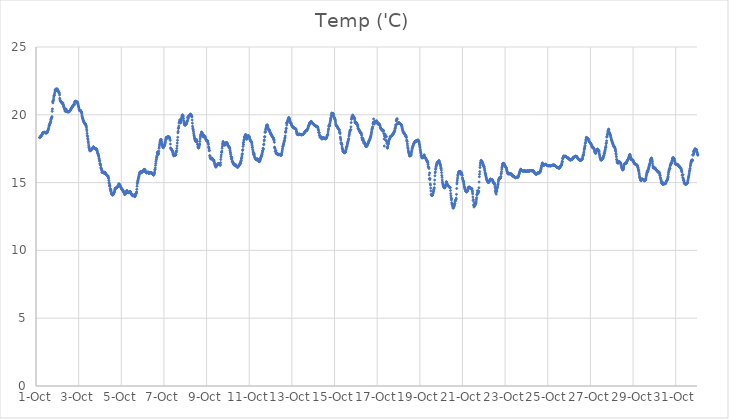
| Category | Temp ('C) |
|---|---|
| 44835.166666666664 | 18.316 |
| 44835.177083333336 | 18.323 |
| 44835.1875 | 18.346 |
| 44835.197916666664 | 18.352 |
| 44835.208333333336 | 18.401 |
| 44835.21875 | 18.418 |
| 44835.229166666664 | 18.423 |
| 44835.239583333336 | 18.449 |
| 44835.25 | 18.444 |
| 44835.260416666664 | 18.484 |
| 44835.270833333336 | 18.513 |
| 44835.28125 | 18.518 |
| 44835.291666666664 | 18.571 |
| 44835.302083333336 | 18.615 |
| 44835.3125 | 18.644 |
| 44835.322916666664 | 18.661 |
| 44835.333333333336 | 18.691 |
| 44835.34375 | 18.705 |
| 44835.354166666664 | 18.66 |
| 44835.364583333336 | 18.673 |
| 44835.375 | 18.666 |
| 44835.385416666664 | 18.716 |
| 44835.395833333336 | 18.705 |
| 44835.40625 | 18.696 |
| 44835.416666666664 | 18.709 |
| 44835.427083333336 | 18.708 |
| 44835.4375 | 18.697 |
| 44835.447916666664 | 18.677 |
| 44835.458333333336 | 18.656 |
| 44835.46875 | 18.69 |
| 44835.479166666664 | 18.652 |
| 44835.489583333336 | 18.699 |
| 44835.5 | 18.677 |
| 44835.510416666664 | 18.669 |
| 44835.520833333336 | 18.687 |
| 44835.53125 | 18.707 |
| 44835.541666666664 | 18.762 |
| 44835.552083333336 | 18.815 |
| 44835.5625 | 18.862 |
| 44835.572916666664 | 18.905 |
| 44835.583333333336 | 18.945 |
| 44835.59375 | 19.011 |
| 44835.604166666664 | 19.09 |
| 44835.614583333336 | 19.183 |
| 44835.625 | 19.224 |
| 44835.635416666664 | 19.267 |
| 44835.645833333336 | 19.33 |
| 44835.65625 | 19.365 |
| 44835.666666666664 | 19.397 |
| 44835.677083333336 | 19.439 |
| 44835.6875 | 19.517 |
| 44835.697916666664 | 19.621 |
| 44835.708333333336 | 19.674 |
| 44835.71875 | 19.729 |
| 44835.729166666664 | 19.785 |
| 44835.739583333336 | 19.809 |
| 44835.75 | 19.866 |
| 44835.760416666664 | 20.257 |
| 44835.770833333336 | 20.434 |
| 44835.78125 | 20.975 |
| 44835.791666666664 | 20.875 |
| 44835.802083333336 | 21.007 |
| 44835.8125 | 21.067 |
| 44835.822916666664 | 21.156 |
| 44835.833333333336 | 21.311 |
| 44835.84375 | 21.408 |
| 44835.854166666664 | 21.454 |
| 44835.864583333336 | 21.44 |
| 44835.875 | 21.59 |
| 44835.885416666664 | 21.683 |
| 44835.895833333336 | 21.836 |
| 44835.90625 | 21.815 |
| 44835.916666666664 | 21.844 |
| 44835.927083333336 | 21.895 |
| 44835.9375 | 21.79 |
| 44835.947916666664 | 21.871 |
| 44835.958333333336 | 21.793 |
| 44835.96875 | 21.844 |
| 44835.979166666664 | 21.918 |
| 44835.989583333336 | 21.901 |
| 44836.0 | 21.878 |
| 44836.010416666664 | 21.838 |
| 44836.020833333336 | 21.82 |
| 44836.03125 | 21.748 |
| 44836.041666666664 | 21.747 |
| 44836.052083333336 | 21.732 |
| 44836.0625 | 21.706 |
| 44836.072916666664 | 21.647 |
| 44836.083333333336 | 21.604 |
| 44836.09375 | 21.597 |
| 44836.104166666664 | 21.464 |
| 44836.114583333336 | 21.218 |
| 44836.125 | 21.097 |
| 44836.135416666664 | 21.034 |
| 44836.145833333336 | 21.001 |
| 44836.15625 | 20.998 |
| 44836.166666666664 | 20.982 |
| 44836.177083333336 | 20.953 |
| 44836.1875 | 20.934 |
| 44836.197916666664 | 20.919 |
| 44836.208333333336 | 20.902 |
| 44836.21875 | 20.879 |
| 44836.229166666664 | 20.845 |
| 44836.239583333336 | 20.822 |
| 44836.25 | 20.857 |
| 44836.260416666664 | 20.878 |
| 44836.270833333336 | 20.789 |
| 44836.28125 | 20.731 |
| 44836.291666666664 | 20.667 |
| 44836.302083333336 | 20.594 |
| 44836.3125 | 20.558 |
| 44836.322916666664 | 20.5 |
| 44836.333333333336 | 20.439 |
| 44836.34375 | 20.418 |
| 44836.354166666664 | 20.365 |
| 44836.364583333336 | 20.287 |
| 44836.375 | 20.253 |
| 44836.385416666664 | 20.417 |
| 44836.395833333336 | 20.286 |
| 44836.40625 | 20.286 |
| 44836.416666666664 | 20.412 |
| 44836.427083333336 | 20.293 |
| 44836.4375 | 20.297 |
| 44836.447916666664 | 20.251 |
| 44836.458333333336 | 20.224 |
| 44836.46875 | 20.217 |
| 44836.479166666664 | 20.225 |
| 44836.489583333336 | 20.235 |
| 44836.5 | 20.235 |
| 44836.510416666664 | 20.247 |
| 44836.520833333336 | 20.231 |
| 44836.53125 | 20.218 |
| 44836.541666666664 | 20.22 |
| 44836.552083333336 | 20.234 |
| 44836.5625 | 20.243 |
| 44836.572916666664 | 20.265 |
| 44836.583333333336 | 20.278 |
| 44836.59375 | 20.296 |
| 44836.604166666664 | 20.321 |
| 44836.614583333336 | 20.347 |
| 44836.625 | 20.37 |
| 44836.635416666664 | 20.41 |
| 44836.645833333336 | 20.449 |
| 44836.65625 | 20.477 |
| 44836.666666666664 | 20.504 |
| 44836.677083333336 | 20.537 |
| 44836.6875 | 20.552 |
| 44836.697916666664 | 20.57 |
| 44836.708333333336 | 20.596 |
| 44836.71875 | 20.627 |
| 44836.729166666664 | 20.658 |
| 44836.739583333336 | 20.687 |
| 44836.75 | 20.712 |
| 44836.760416666664 | 20.745 |
| 44836.770833333336 | 20.752 |
| 44836.78125 | 20.785 |
| 44836.791666666664 | 20.788 |
| 44836.802083333336 | 20.735 |
| 44836.8125 | 20.901 |
| 44836.822916666664 | 20.973 |
| 44836.833333333336 | 20.963 |
| 44836.84375 | 20.987 |
| 44836.854166666664 | 21.003 |
| 44836.864583333336 | 20.987 |
| 44836.875 | 20.973 |
| 44836.885416666664 | 20.976 |
| 44836.895833333336 | 20.936 |
| 44836.90625 | 20.969 |
| 44836.916666666664 | 20.955 |
| 44836.927083333336 | 20.95 |
| 44836.9375 | 20.918 |
| 44836.947916666664 | 20.909 |
| 44836.958333333336 | 20.83 |
| 44836.96875 | 20.79 |
| 44836.979166666664 | 20.718 |
| 44836.989583333336 | 20.641 |
| 44837.0 | 20.579 |
| 44837.010416666664 | 20.508 |
| 44837.020833333336 | 20.421 |
| 44837.03125 | 20.368 |
| 44837.041666666664 | 20.305 |
| 44837.052083333336 | 20.35 |
| 44837.0625 | 20.337 |
| 44837.072916666664 | 20.308 |
| 44837.083333333336 | 20.319 |
| 44837.09375 | 20.318 |
| 44837.104166666664 | 20.275 |
| 44837.114583333336 | 20.239 |
| 44837.125 | 20.203 |
| 44837.135416666664 | 20.198 |
| 44837.145833333336 | 20.093 |
| 44837.15625 | 19.977 |
| 44837.166666666664 | 19.878 |
| 44837.177083333336 | 19.787 |
| 44837.1875 | 19.73 |
| 44837.197916666664 | 19.69 |
| 44837.208333333336 | 19.625 |
| 44837.21875 | 19.584 |
| 44837.229166666664 | 19.544 |
| 44837.239583333336 | 19.489 |
| 44837.25 | 19.461 |
| 44837.260416666664 | 19.424 |
| 44837.270833333336 | 19.404 |
| 44837.28125 | 19.376 |
| 44837.291666666664 | 19.334 |
| 44837.302083333336 | 19.31 |
| 44837.3125 | 19.336 |
| 44837.322916666664 | 19.32 |
| 44837.333333333336 | 19.261 |
| 44837.34375 | 19.2 |
| 44837.354166666664 | 19.164 |
| 44837.364583333336 | 19.081 |
| 44837.375 | 18.938 |
| 44837.385416666664 | 18.811 |
| 44837.395833333336 | 18.632 |
| 44837.40625 | 18.473 |
| 44837.416666666664 | 18.404 |
| 44837.427083333336 | 18.257 |
| 44837.4375 | 18.154 |
| 44837.447916666664 | 18.03 |
| 44837.458333333336 | 17.92 |
| 44837.46875 | 17.77 |
| 44837.479166666664 | 17.597 |
| 44837.489583333336 | 17.636 |
| 44837.5 | 17.492 |
| 44837.510416666664 | 17.457 |
| 44837.520833333336 | 17.362 |
| 44837.53125 | 17.333 |
| 44837.541666666664 | 17.406 |
| 44837.552083333336 | 17.354 |
| 44837.5625 | 17.403 |
| 44837.572916666664 | 17.429 |
| 44837.583333333336 | 17.412 |
| 44837.59375 | 17.422 |
| 44837.604166666664 | 17.431 |
| 44837.614583333336 | 17.504 |
| 44837.625 | 17.467 |
| 44837.635416666664 | 17.504 |
| 44837.645833333336 | 17.507 |
| 44837.65625 | 17.532 |
| 44837.666666666664 | 17.578 |
| 44837.677083333336 | 17.612 |
| 44837.6875 | 17.627 |
| 44837.697916666664 | 17.647 |
| 44837.708333333336 | 17.607 |
| 44837.71875 | 17.588 |
| 44837.729166666664 | 17.587 |
| 44837.739583333336 | 17.544 |
| 44837.75 | 17.526 |
| 44837.760416666664 | 17.511 |
| 44837.770833333336 | 17.497 |
| 44837.78125 | 17.501 |
| 44837.791666666664 | 17.499 |
| 44837.802083333336 | 17.497 |
| 44837.8125 | 17.489 |
| 44837.822916666664 | 17.431 |
| 44837.833333333336 | 17.495 |
| 44837.84375 | 17.453 |
| 44837.854166666664 | 17.412 |
| 44837.864583333336 | 17.365 |
| 44837.875 | 17.294 |
| 44837.885416666664 | 17.223 |
| 44837.895833333336 | 17.166 |
| 44837.90625 | 17.136 |
| 44837.916666666664 | 17.05 |
| 44837.927083333336 | 17.036 |
| 44837.9375 | 16.967 |
| 44837.947916666664 | 16.893 |
| 44837.958333333336 | 16.778 |
| 44837.96875 | 16.725 |
| 44837.979166666664 | 16.585 |
| 44837.989583333336 | 16.599 |
| 44838.0 | 16.378 |
| 44838.010416666664 | 16.402 |
| 44838.020833333336 | 16.311 |
| 44838.03125 | 16.282 |
| 44838.041666666664 | 16.126 |
| 44838.052083333336 | 16.062 |
| 44838.0625 | 16.038 |
| 44838.072916666664 | 15.975 |
| 44838.083333333336 | 15.882 |
| 44838.09375 | 15.763 |
| 44838.104166666664 | 15.765 |
| 44838.114583333336 | 15.746 |
| 44838.125 | 15.767 |
| 44838.135416666664 | 15.757 |
| 44838.145833333336 | 15.741 |
| 44838.15625 | 15.748 |
| 44838.166666666664 | 15.751 |
| 44838.177083333336 | 15.791 |
| 44838.1875 | 15.739 |
| 44838.197916666664 | 15.698 |
| 44838.208333333336 | 15.667 |
| 44838.21875 | 15.758 |
| 44838.229166666664 | 15.759 |
| 44838.239583333336 | 15.751 |
| 44838.25 | 15.727 |
| 44838.260416666664 | 15.681 |
| 44838.270833333336 | 15.63 |
| 44838.28125 | 15.613 |
| 44838.291666666664 | 15.604 |
| 44838.302083333336 | 15.588 |
| 44838.3125 | 15.571 |
| 44838.322916666664 | 15.547 |
| 44838.333333333336 | 15.529 |
| 44838.34375 | 15.503 |
| 44838.354166666664 | 15.476 |
| 44838.364583333336 | 15.505 |
| 44838.375 | 15.483 |
| 44838.385416666664 | 15.432 |
| 44838.395833333336 | 15.353 |
| 44838.40625 | 15.296 |
| 44838.416666666664 | 15.159 |
| 44838.427083333336 | 15.011 |
| 44838.4375 | 14.935 |
| 44838.447916666664 | 14.755 |
| 44838.458333333336 | 14.817 |
| 44838.46875 | 14.742 |
| 44838.479166666664 | 14.559 |
| 44838.489583333336 | 14.518 |
| 44838.5 | 14.404 |
| 44838.510416666664 | 14.369 |
| 44838.520833333336 | 14.448 |
| 44838.53125 | 14.282 |
| 44838.541666666664 | 14.193 |
| 44838.552083333336 | 14.113 |
| 44838.5625 | 14.15 |
| 44838.572916666664 | 14.22 |
| 44838.583333333336 | 14.086 |
| 44838.59375 | 14.081 |
| 44838.604166666664 | 14.115 |
| 44838.614583333336 | 14.142 |
| 44838.625 | 14.112 |
| 44838.635416666664 | 14.17 |
| 44838.645833333336 | 14.186 |
| 44838.65625 | 14.241 |
| 44838.666666666664 | 14.293 |
| 44838.677083333336 | 14.323 |
| 44838.6875 | 14.393 |
| 44838.697916666664 | 14.47 |
| 44838.708333333336 | 14.532 |
| 44838.71875 | 14.569 |
| 44838.729166666664 | 14.573 |
| 44838.739583333336 | 14.572 |
| 44838.75 | 14.584 |
| 44838.760416666664 | 14.609 |
| 44838.770833333336 | 14.626 |
| 44838.78125 | 14.641 |
| 44838.791666666664 | 14.652 |
| 44838.802083333336 | 14.65 |
| 44838.8125 | 14.655 |
| 44838.822916666664 | 14.688 |
| 44838.833333333336 | 14.715 |
| 44838.84375 | 14.745 |
| 44838.854166666664 | 14.785 |
| 44838.864583333336 | 14.812 |
| 44838.875 | 14.847 |
| 44838.885416666664 | 14.92 |
| 44838.895833333336 | 14.887 |
| 44838.90625 | 14.813 |
| 44838.916666666664 | 14.787 |
| 44838.927083333336 | 14.852 |
| 44838.9375 | 14.771 |
| 44838.947916666664 | 14.742 |
| 44838.958333333336 | 14.71 |
| 44838.96875 | 14.7 |
| 44838.979166666664 | 14.669 |
| 44838.989583333336 | 14.62 |
| 44839.0 | 14.591 |
| 44839.010416666664 | 14.542 |
| 44839.020833333336 | 14.519 |
| 44839.03125 | 14.482 |
| 44839.041666666664 | 14.471 |
| 44839.052083333336 | 14.491 |
| 44839.0625 | 14.476 |
| 44839.072916666664 | 14.407 |
| 44839.083333333336 | 14.385 |
| 44839.09375 | 14.367 |
| 44839.104166666664 | 14.315 |
| 44839.114583333336 | 14.289 |
| 44839.125 | 14.331 |
| 44839.135416666664 | 14.237 |
| 44839.145833333336 | 14.185 |
| 44839.15625 | 14.117 |
| 44839.166666666664 | 14.124 |
| 44839.177083333336 | 14.175 |
| 44839.1875 | 14.201 |
| 44839.197916666664 | 14.208 |
| 44839.208333333336 | 14.228 |
| 44839.21875 | 14.224 |
| 44839.229166666664 | 14.234 |
| 44839.239583333336 | 14.278 |
| 44839.25 | 14.395 |
| 44839.260416666664 | 14.421 |
| 44839.270833333336 | 14.4 |
| 44839.28125 | 14.352 |
| 44839.291666666664 | 14.306 |
| 44839.302083333336 | 14.283 |
| 44839.3125 | 14.265 |
| 44839.322916666664 | 14.259 |
| 44839.333333333336 | 14.257 |
| 44839.34375 | 14.266 |
| 44839.354166666664 | 14.276 |
| 44839.364583333336 | 14.279 |
| 44839.375 | 14.286 |
| 44839.385416666664 | 14.283 |
| 44839.395833333336 | 14.291 |
| 44839.40625 | 14.359 |
| 44839.416666666664 | 14.336 |
| 44839.427083333336 | 14.314 |
| 44839.4375 | 14.269 |
| 44839.447916666664 | 14.193 |
| 44839.458333333336 | 14.165 |
| 44839.46875 | 14.161 |
| 44839.479166666664 | 14.16 |
| 44839.489583333336 | 14.14 |
| 44839.5 | 14.125 |
| 44839.510416666664 | 14.074 |
| 44839.520833333336 | 14.067 |
| 44839.53125 | 14.028 |
| 44839.541666666664 | 14.04 |
| 44839.552083333336 | 14.055 |
| 44839.5625 | 14.053 |
| 44839.572916666664 | 14.046 |
| 44839.583333333336 | 14.06 |
| 44839.59375 | 14.06 |
| 44839.604166666664 | 14.096 |
| 44839.614583333336 | 14.026 |
| 44839.625 | 13.968 |
| 44839.635416666664 | 13.966 |
| 44839.645833333336 | 13.98 |
| 44839.65625 | 14.053 |
| 44839.666666666664 | 14.098 |
| 44839.677083333336 | 14.19 |
| 44839.6875 | 14.182 |
| 44839.697916666664 | 14.197 |
| 44839.708333333336 | 14.24 |
| 44839.71875 | 14.325 |
| 44839.729166666664 | 14.506 |
| 44839.739583333336 | 14.732 |
| 44839.75 | 14.914 |
| 44839.760416666664 | 15.014 |
| 44839.770833333336 | 15.097 |
| 44839.78125 | 15.144 |
| 44839.791666666664 | 15.241 |
| 44839.802083333336 | 15.315 |
| 44839.8125 | 15.379 |
| 44839.822916666664 | 15.442 |
| 44839.833333333336 | 15.53 |
| 44839.84375 | 15.59 |
| 44839.854166666664 | 15.656 |
| 44839.864583333336 | 15.737 |
| 44839.875 | 15.773 |
| 44839.885416666664 | 15.779 |
| 44839.895833333336 | 15.79 |
| 44839.90625 | 15.792 |
| 44839.916666666664 | 15.79 |
| 44839.927083333336 | 15.784 |
| 44839.9375 | 15.758 |
| 44839.947916666664 | 15.726 |
| 44839.958333333336 | 15.759 |
| 44839.96875 | 15.786 |
| 44839.979166666664 | 15.798 |
| 44839.989583333336 | 15.813 |
| 44840.0 | 15.838 |
| 44840.010416666664 | 15.849 |
| 44840.020833333336 | 15.846 |
| 44840.03125 | 15.864 |
| 44840.041666666664 | 15.85 |
| 44840.052083333336 | 15.938 |
| 44840.0625 | 15.965 |
| 44840.072916666664 | 15.963 |
| 44840.083333333336 | 15.967 |
| 44840.09375 | 15.969 |
| 44840.104166666664 | 15.931 |
| 44840.114583333336 | 15.919 |
| 44840.125 | 15.912 |
| 44840.135416666664 | 15.793 |
| 44840.145833333336 | 15.754 |
| 44840.15625 | 15.75 |
| 44840.166666666664 | 15.746 |
| 44840.177083333336 | 15.732 |
| 44840.1875 | 15.721 |
| 44840.197916666664 | 15.718 |
| 44840.208333333336 | 15.737 |
| 44840.21875 | 15.741 |
| 44840.229166666664 | 15.751 |
| 44840.239583333336 | 15.759 |
| 44840.25 | 15.77 |
| 44840.260416666664 | 15.779 |
| 44840.270833333336 | 15.769 |
| 44840.28125 | 15.699 |
| 44840.291666666664 | 15.674 |
| 44840.302083333336 | 15.689 |
| 44840.3125 | 15.714 |
| 44840.322916666664 | 15.731 |
| 44840.333333333336 | 15.735 |
| 44840.34375 | 15.732 |
| 44840.354166666664 | 15.729 |
| 44840.364583333336 | 15.725 |
| 44840.375 | 15.726 |
| 44840.385416666664 | 15.726 |
| 44840.395833333336 | 15.725 |
| 44840.40625 | 15.722 |
| 44840.416666666664 | 15.71 |
| 44840.427083333336 | 15.695 |
| 44840.4375 | 15.674 |
| 44840.447916666664 | 15.673 |
| 44840.458333333336 | 15.693 |
| 44840.46875 | 15.633 |
| 44840.479166666664 | 15.606 |
| 44840.489583333336 | 15.593 |
| 44840.5 | 15.572 |
| 44840.510416666664 | 15.567 |
| 44840.520833333336 | 15.56 |
| 44840.53125 | 15.567 |
| 44840.541666666664 | 15.659 |
| 44840.552083333336 | 15.672 |
| 44840.5625 | 15.782 |
| 44840.572916666664 | 15.934 |
| 44840.583333333336 | 15.978 |
| 44840.59375 | 16.082 |
| 44840.604166666664 | 16.271 |
| 44840.614583333336 | 16.413 |
| 44840.625 | 16.563 |
| 44840.635416666664 | 16.668 |
| 44840.645833333336 | 16.737 |
| 44840.65625 | 16.893 |
| 44840.666666666664 | 16.858 |
| 44840.677083333336 | 16.986 |
| 44840.6875 | 17.206 |
| 44840.697916666664 | 17.12 |
| 44840.708333333336 | 17.275 |
| 44840.71875 | 17.184 |
| 44840.729166666664 | 17.053 |
| 44840.739583333336 | 17.117 |
| 44840.75 | 17.17 |
| 44840.760416666664 | 17.314 |
| 44840.770833333336 | 17.53 |
| 44840.78125 | 17.631 |
| 44840.791666666664 | 17.767 |
| 44840.802083333336 | 17.845 |
| 44840.8125 | 17.947 |
| 44840.822916666664 | 18.05 |
| 44840.833333333336 | 18.111 |
| 44840.84375 | 18.164 |
| 44840.854166666664 | 18.192 |
| 44840.864583333336 | 18.183 |
| 44840.875 | 18.133 |
| 44840.885416666664 | 18.039 |
| 44840.895833333336 | 17.938 |
| 44840.90625 | 17.845 |
| 44840.916666666664 | 17.78 |
| 44840.927083333336 | 17.721 |
| 44840.9375 | 17.668 |
| 44840.947916666664 | 17.643 |
| 44840.958333333336 | 17.603 |
| 44840.96875 | 17.569 |
| 44840.979166666664 | 17.593 |
| 44840.989583333336 | 17.692 |
| 44841.0 | 17.719 |
| 44841.010416666664 | 17.694 |
| 44841.020833333336 | 17.733 |
| 44841.03125 | 17.738 |
| 44841.041666666664 | 17.829 |
| 44841.052083333336 | 17.895 |
| 44841.0625 | 17.956 |
| 44841.072916666664 | 18.068 |
| 44841.083333333336 | 18.172 |
| 44841.09375 | 18.235 |
| 44841.104166666664 | 18.349 |
| 44841.114583333336 | 18.305 |
| 44841.125 | 18.292 |
| 44841.135416666664 | 18.302 |
| 44841.145833333336 | 18.265 |
| 44841.15625 | 18.312 |
| 44841.166666666664 | 18.338 |
| 44841.177083333336 | 18.37 |
| 44841.1875 | 18.388 |
| 44841.197916666664 | 18.38 |
| 44841.208333333336 | 18.392 |
| 44841.21875 | 18.396 |
| 44841.229166666664 | 18.379 |
| 44841.239583333336 | 18.34 |
| 44841.25 | 18.297 |
| 44841.260416666664 | 18.317 |
| 44841.270833333336 | 18.285 |
| 44841.28125 | 18.194 |
| 44841.291666666664 | 18.11 |
| 44841.302083333336 | 17.845 |
| 44841.3125 | 17.563 |
| 44841.322916666664 | 17.489 |
| 44841.333333333336 | 17.498 |
| 44841.34375 | 17.484 |
| 44841.354166666664 | 17.455 |
| 44841.364583333336 | 17.415 |
| 44841.375 | 17.39 |
| 44841.385416666664 | 17.367 |
| 44841.395833333336 | 17.334 |
| 44841.40625 | 17.286 |
| 44841.416666666664 | 17.211 |
| 44841.427083333336 | 17.121 |
| 44841.4375 | 17.065 |
| 44841.447916666664 | 17.018 |
| 44841.458333333336 | 16.987 |
| 44841.46875 | 16.968 |
| 44841.479166666664 | 17.063 |
| 44841.489583333336 | 17.119 |
| 44841.5 | 17.041 |
| 44841.510416666664 | 17.048 |
| 44841.520833333336 | 17.035 |
| 44841.53125 | 17.002 |
| 44841.541666666664 | 17.067 |
| 44841.552083333336 | 17.046 |
| 44841.5625 | 17.07 |
| 44841.572916666664 | 17.28 |
| 44841.583333333336 | 17.244 |
| 44841.59375 | 17.357 |
| 44841.604166666664 | 17.522 |
| 44841.614583333336 | 17.709 |
| 44841.625 | 17.922 |
| 44841.635416666664 | 18.12 |
| 44841.645833333336 | 18.34 |
| 44841.65625 | 18.671 |
| 44841.666666666664 | 18.786 |
| 44841.677083333336 | 18.986 |
| 44841.6875 | 19.047 |
| 44841.697916666664 | 19.17 |
| 44841.708333333336 | 19.387 |
| 44841.71875 | 19.456 |
| 44841.729166666664 | 19.502 |
| 44841.739583333336 | 19.622 |
| 44841.75 | 19.581 |
| 44841.760416666664 | 19.523 |
| 44841.770833333336 | 19.392 |
| 44841.78125 | 19.44 |
| 44841.791666666664 | 19.551 |
| 44841.802083333336 | 19.534 |
| 44841.8125 | 19.623 |
| 44841.822916666664 | 19.706 |
| 44841.833333333336 | 19.779 |
| 44841.84375 | 19.861 |
| 44841.854166666664 | 19.942 |
| 44841.864583333336 | 19.979 |
| 44841.875 | 19.992 |
| 44841.885416666664 | 19.974 |
| 44841.895833333336 | 19.936 |
| 44841.90625 | 19.853 |
| 44841.916666666664 | 19.724 |
| 44841.927083333336 | 19.57 |
| 44841.9375 | 19.46 |
| 44841.947916666664 | 19.378 |
| 44841.958333333336 | 19.302 |
| 44841.96875 | 19.272 |
| 44841.979166666664 | 19.25 |
| 44841.989583333336 | 19.248 |
| 44842.0 | 19.221 |
| 44842.010416666664 | 19.305 |
| 44842.020833333336 | 19.365 |
| 44842.03125 | 19.27 |
| 44842.041666666664 | 19.337 |
| 44842.052083333336 | 19.359 |
| 44842.0625 | 19.356 |
| 44842.072916666664 | 19.457 |
| 44842.083333333336 | 19.496 |
| 44842.09375 | 19.544 |
| 44842.104166666664 | 19.582 |
| 44842.114583333336 | 19.78 |
| 44842.125 | 19.845 |
| 44842.135416666664 | 19.84 |
| 44842.145833333336 | 19.722 |
| 44842.15625 | 19.872 |
| 44842.166666666664 | 19.907 |
| 44842.177083333336 | 19.92 |
| 44842.1875 | 19.932 |
| 44842.197916666664 | 19.957 |
| 44842.208333333336 | 19.99 |
| 44842.21875 | 20.013 |
| 44842.229166666664 | 20.039 |
| 44842.239583333336 | 20.049 |
| 44842.25 | 20.019 |
| 44842.260416666664 | 20.036 |
| 44842.270833333336 | 20.008 |
| 44842.28125 | 19.913 |
| 44842.291666666664 | 19.923 |
| 44842.302083333336 | 19.88 |
| 44842.3125 | 19.844 |
| 44842.322916666664 | 19.617 |
| 44842.333333333336 | 19.383 |
| 44842.34375 | 19.158 |
| 44842.354166666664 | 19.021 |
| 44842.364583333336 | 18.941 |
| 44842.375 | 18.881 |
| 44842.385416666664 | 18.769 |
| 44842.395833333336 | 18.635 |
| 44842.40625 | 18.508 |
| 44842.416666666664 | 18.442 |
| 44842.427083333336 | 18.362 |
| 44842.4375 | 18.269 |
| 44842.447916666664 | 18.21 |
| 44842.458333333336 | 18.159 |
| 44842.46875 | 18.124 |
| 44842.479166666664 | 18.085 |
| 44842.489583333336 | 18.05 |
| 44842.5 | 18.019 |
| 44842.510416666664 | 18.012 |
| 44842.520833333336 | 18.009 |
| 44842.53125 | 18.176 |
| 44842.541666666664 | 18.068 |
| 44842.552083333336 | 18.068 |
| 44842.5625 | 18.018 |
| 44842.572916666664 | 17.822 |
| 44842.583333333336 | 17.807 |
| 44842.59375 | 17.672 |
| 44842.604166666664 | 17.608 |
| 44842.614583333336 | 17.562 |
| 44842.625 | 17.55 |
| 44842.635416666664 | 17.582 |
| 44842.645833333336 | 17.64 |
| 44842.65625 | 17.739 |
| 44842.666666666664 | 17.817 |
| 44842.677083333336 | 17.846 |
| 44842.6875 | 18.039 |
| 44842.697916666664 | 18.222 |
| 44842.708333333336 | 18.357 |
| 44842.71875 | 18.446 |
| 44842.729166666664 | 18.526 |
| 44842.739583333336 | 18.571 |
| 44842.75 | 18.606 |
| 44842.760416666664 | 18.739 |
| 44842.770833333336 | 18.654 |
| 44842.78125 | 18.669 |
| 44842.791666666664 | 18.645 |
| 44842.802083333336 | 18.642 |
| 44842.8125 | 18.577 |
| 44842.822916666664 | 18.541 |
| 44842.833333333336 | 18.477 |
| 44842.84375 | 18.395 |
| 44842.854166666664 | 18.362 |
| 44842.864583333336 | 18.433 |
| 44842.875 | 18.452 |
| 44842.885416666664 | 18.446 |
| 44842.895833333336 | 18.447 |
| 44842.90625 | 18.443 |
| 44842.916666666664 | 18.418 |
| 44842.927083333336 | 18.377 |
| 44842.9375 | 18.345 |
| 44842.947916666664 | 18.289 |
| 44842.958333333336 | 18.238 |
| 44842.96875 | 18.19 |
| 44842.979166666664 | 18.149 |
| 44842.989583333336 | 18.117 |
| 44843.0 | 18.094 |
| 44843.010416666664 | 18.084 |
| 44843.020833333336 | 18.074 |
| 44843.03125 | 18.062 |
| 44843.041666666664 | 18.044 |
| 44843.052083333336 | 18.087 |
| 44843.0625 | 17.951 |
| 44843.072916666664 | 17.899 |
| 44843.083333333336 | 17.804 |
| 44843.09375 | 17.614 |
| 44843.104166666664 | 17.604 |
| 44843.114583333336 | 17.492 |
| 44843.125 | 17.353 |
| 44843.135416666664 | 17.372 |
| 44843.145833333336 | 16.986 |
| 44843.15625 | 16.974 |
| 44843.166666666664 | 16.848 |
| 44843.177083333336 | 16.799 |
| 44843.1875 | 16.757 |
| 44843.197916666664 | 16.834 |
| 44843.208333333336 | 16.791 |
| 44843.21875 | 16.74 |
| 44843.229166666664 | 16.774 |
| 44843.239583333336 | 16.768 |
| 44843.25 | 16.819 |
| 44843.260416666664 | 16.786 |
| 44843.270833333336 | 16.761 |
| 44843.28125 | 16.721 |
| 44843.291666666664 | 16.709 |
| 44843.302083333336 | 16.65 |
| 44843.3125 | 16.647 |
| 44843.322916666664 | 16.664 |
| 44843.333333333336 | 16.676 |
| 44843.34375 | 16.641 |
| 44843.354166666664 | 16.578 |
| 44843.364583333336 | 16.486 |
| 44843.375 | 16.428 |
| 44843.385416666664 | 16.366 |
| 44843.395833333336 | 16.298 |
| 44843.40625 | 16.26 |
| 44843.416666666664 | 16.216 |
| 44843.427083333336 | 16.166 |
| 44843.4375 | 16.147 |
| 44843.447916666664 | 16.162 |
| 44843.458333333336 | 16.201 |
| 44843.46875 | 16.269 |
| 44843.479166666664 | 16.277 |
| 44843.489583333336 | 16.305 |
| 44843.5 | 16.314 |
| 44843.510416666664 | 16.34 |
| 44843.520833333336 | 16.333 |
| 44843.53125 | 16.361 |
| 44843.541666666664 | 16.393 |
| 44843.552083333336 | 16.414 |
| 44843.5625 | 16.4 |
| 44843.572916666664 | 16.399 |
| 44843.583333333336 | 16.406 |
| 44843.59375 | 16.354 |
| 44843.604166666664 | 16.328 |
| 44843.614583333336 | 16.328 |
| 44843.625 | 16.338 |
| 44843.635416666664 | 16.273 |
| 44843.645833333336 | 16.303 |
| 44843.65625 | 16.473 |
| 44843.666666666664 | 16.707 |
| 44843.677083333336 | 16.887 |
| 44843.6875 | 17.043 |
| 44843.697916666664 | 17.235 |
| 44843.708333333336 | 17.227 |
| 44843.71875 | 17.328 |
| 44843.729166666664 | 17.537 |
| 44843.739583333336 | 17.678 |
| 44843.75 | 17.832 |
| 44843.760416666664 | 17.9 |
| 44843.770833333336 | 18.031 |
| 44843.78125 | 17.978 |
| 44843.791666666664 | 17.927 |
| 44843.802083333336 | 17.884 |
| 44843.8125 | 17.854 |
| 44843.822916666664 | 17.921 |
| 44843.833333333336 | 17.831 |
| 44843.84375 | 17.781 |
| 44843.854166666664 | 17.754 |
| 44843.864583333336 | 17.8 |
| 44843.875 | 17.817 |
| 44843.885416666664 | 17.879 |
| 44843.895833333336 | 17.897 |
| 44843.90625 | 17.905 |
| 44843.916666666664 | 17.945 |
| 44843.927083333336 | 17.955 |
| 44843.9375 | 17.952 |
| 44843.947916666664 | 17.944 |
| 44843.958333333336 | 17.928 |
| 44843.96875 | 17.887 |
| 44843.979166666664 | 17.831 |
| 44843.989583333336 | 17.786 |
| 44844.0 | 17.739 |
| 44844.010416666664 | 17.71 |
| 44844.020833333336 | 17.693 |
| 44844.03125 | 17.676 |
| 44844.041666666664 | 17.664 |
| 44844.052083333336 | 17.634 |
| 44844.0625 | 17.6 |
| 44844.072916666664 | 17.593 |
| 44844.083333333336 | 17.534 |
| 44844.09375 | 17.479 |
| 44844.104166666664 | 17.354 |
| 44844.114583333336 | 17.245 |
| 44844.125 | 17.18 |
| 44844.135416666664 | 17.056 |
| 44844.145833333336 | 16.928 |
| 44844.15625 | 16.903 |
| 44844.166666666664 | 16.737 |
| 44844.177083333336 | 16.765 |
| 44844.1875 | 16.827 |
| 44844.197916666664 | 16.58 |
| 44844.208333333336 | 16.575 |
| 44844.21875 | 16.552 |
| 44844.229166666664 | 16.496 |
| 44844.239583333336 | 16.444 |
| 44844.25 | 16.446 |
| 44844.260416666664 | 16.369 |
| 44844.270833333336 | 16.404 |
| 44844.28125 | 16.309 |
| 44844.291666666664 | 16.322 |
| 44844.302083333336 | 16.352 |
| 44844.3125 | 16.296 |
| 44844.322916666664 | 16.262 |
| 44844.333333333336 | 16.28 |
| 44844.34375 | 16.27 |
| 44844.354166666664 | 16.301 |
| 44844.364583333336 | 16.312 |
| 44844.375 | 16.296 |
| 44844.385416666664 | 16.266 |
| 44844.395833333336 | 16.226 |
| 44844.40625 | 16.184 |
| 44844.416666666664 | 16.163 |
| 44844.427083333336 | 16.157 |
| 44844.4375 | 16.16 |
| 44844.447916666664 | 16.147 |
| 44844.458333333336 | 16.127 |
| 44844.46875 | 16.146 |
| 44844.479166666664 | 16.182 |
| 44844.489583333336 | 16.202 |
| 44844.5 | 16.229 |
| 44844.510416666664 | 16.226 |
| 44844.520833333336 | 16.253 |
| 44844.53125 | 16.276 |
| 44844.541666666664 | 16.308 |
| 44844.552083333336 | 16.346 |
| 44844.5625 | 16.383 |
| 44844.572916666664 | 16.439 |
| 44844.583333333336 | 16.465 |
| 44844.59375 | 16.41 |
| 44844.604166666664 | 16.541 |
| 44844.614583333336 | 16.609 |
| 44844.625 | 16.66 |
| 44844.635416666664 | 16.781 |
| 44844.645833333336 | 16.825 |
| 44844.65625 | 16.951 |
| 44844.666666666664 | 17.069 |
| 44844.677083333336 | 17.13 |
| 44844.6875 | 17.371 |
| 44844.697916666664 | 17.437 |
| 44844.708333333336 | 17.668 |
| 44844.71875 | 17.933 |
| 44844.729166666664 | 17.798 |
| 44844.739583333336 | 17.978 |
| 44844.75 | 18.118 |
| 44844.760416666664 | 18.189 |
| 44844.770833333336 | 18.387 |
| 44844.78125 | 18.31 |
| 44844.791666666664 | 18.331 |
| 44844.802083333336 | 18.364 |
| 44844.8125 | 18.499 |
| 44844.822916666664 | 18.545 |
| 44844.833333333336 | 18.545 |
| 44844.84375 | 18.374 |
| 44844.854166666664 | 18.483 |
| 44844.864583333336 | 18.321 |
| 44844.875 | 18.247 |
| 44844.885416666664 | 18.19 |
| 44844.895833333336 | 18.356 |
| 44844.90625 | 18.343 |
| 44844.916666666664 | 18.36 |
| 44844.927083333336 | 18.404 |
| 44844.9375 | 18.427 |
| 44844.947916666664 | 18.444 |
| 44844.958333333336 | 18.473 |
| 44844.96875 | 18.457 |
| 44844.979166666664 | 18.431 |
| 44844.989583333336 | 18.415 |
| 44845.0 | 18.393 |
| 44845.010416666664 | 18.32 |
| 44845.020833333336 | 18.262 |
| 44845.03125 | 18.192 |
| 44845.041666666664 | 18.147 |
| 44845.052083333336 | 18.115 |
| 44845.0625 | 18.093 |
| 44845.072916666664 | 18.062 |
| 44845.083333333336 | 18.045 |
| 44845.09375 | 18.018 |
| 44845.104166666664 | 18.018 |
| 44845.114583333336 | 17.947 |
| 44845.125 | 17.849 |
| 44845.135416666664 | 17.746 |
| 44845.145833333336 | 17.588 |
| 44845.15625 | 17.596 |
| 44845.166666666664 | 17.427 |
| 44845.177083333336 | 17.325 |
| 44845.1875 | 17.237 |
| 44845.197916666664 | 17.062 |
| 44845.208333333336 | 17.155 |
| 44845.21875 | 17.179 |
| 44845.229166666664 | 17.12 |
| 44845.239583333336 | 17.04 |
| 44845.25 | 16.92 |
| 44845.260416666664 | 16.861 |
| 44845.270833333336 | 16.838 |
| 44845.28125 | 16.794 |
| 44845.291666666664 | 16.746 |
| 44845.302083333336 | 16.745 |
| 44845.3125 | 16.709 |
| 44845.322916666664 | 16.685 |
| 44845.333333333336 | 16.729 |
| 44845.34375 | 16.667 |
| 44845.354166666664 | 16.695 |
| 44845.364583333336 | 16.691 |
| 44845.375 | 16.729 |
| 44845.385416666664 | 16.747 |
| 44845.395833333336 | 16.734 |
| 44845.40625 | 16.715 |
| 44845.416666666664 | 16.683 |
| 44845.427083333336 | 16.647 |
| 44845.4375 | 16.61 |
| 44845.447916666664 | 16.582 |
| 44845.458333333336 | 16.581 |
| 44845.46875 | 16.569 |
| 44845.479166666664 | 16.544 |
| 44845.489583333336 | 16.567 |
| 44845.5 | 16.613 |
| 44845.510416666664 | 16.667 |
| 44845.520833333336 | 16.729 |
| 44845.53125 | 16.79 |
| 44845.541666666664 | 16.833 |
| 44845.552083333336 | 16.877 |
| 44845.5625 | 16.93 |
| 44845.572916666664 | 16.962 |
| 44845.583333333336 | 17.009 |
| 44845.59375 | 17.068 |
| 44845.604166666664 | 17.122 |
| 44845.614583333336 | 17.226 |
| 44845.625 | 17.351 |
| 44845.635416666664 | 17.338 |
| 44845.645833333336 | 17.535 |
| 44845.65625 | 17.489 |
| 44845.666666666664 | 17.483 |
| 44845.677083333336 | 17.796 |
| 44845.6875 | 17.841 |
| 44845.697916666664 | 18.074 |
| 44845.708333333336 | 18.151 |
| 44845.71875 | 18.372 |
| 44845.729166666664 | 18.389 |
| 44845.739583333336 | 18.729 |
| 44845.75 | 18.711 |
| 44845.760416666664 | 18.772 |
| 44845.770833333336 | 18.905 |
| 44845.78125 | 18.993 |
| 44845.791666666664 | 19.09 |
| 44845.802083333336 | 19.185 |
| 44845.8125 | 19.206 |
| 44845.822916666664 | 19.223 |
| 44845.833333333336 | 19.238 |
| 44845.84375 | 19.262 |
| 44845.854166666664 | 19.221 |
| 44845.864583333336 | 19.098 |
| 44845.875 | 19.136 |
| 44845.885416666664 | 19.029 |
| 44845.895833333336 | 18.938 |
| 44845.90625 | 18.901 |
| 44845.916666666664 | 18.891 |
| 44845.927083333336 | 18.909 |
| 44845.9375 | 18.877 |
| 44845.947916666664 | 18.835 |
| 44845.958333333336 | 18.785 |
| 44845.96875 | 18.747 |
| 44845.979166666664 | 18.704 |
| 44845.989583333336 | 18.668 |
| 44846.0 | 18.63 |
| 44846.010416666664 | 18.6 |
| 44846.020833333336 | 18.57 |
| 44846.03125 | 18.546 |
| 44846.041666666664 | 18.524 |
| 44846.052083333336 | 18.484 |
| 44846.0625 | 18.45 |
| 44846.072916666664 | 18.418 |
| 44846.083333333336 | 18.395 |
| 44846.09375 | 18.363 |
| 44846.104166666664 | 18.348 |
| 44846.114583333336 | 18.329 |
| 44846.125 | 18.286 |
| 44846.135416666664 | 18.287 |
| 44846.145833333336 | 18.187 |
| 44846.15625 | 18.167 |
| 44846.166666666664 | 18.089 |
| 44846.177083333336 | 17.972 |
| 44846.1875 | 17.621 |
| 44846.197916666664 | 17.552 |
| 44846.208333333336 | 17.527 |
| 44846.21875 | 17.299 |
| 44846.229166666664 | 17.344 |
| 44846.239583333336 | 17.367 |
| 44846.25 | 17.343 |
| 44846.260416666664 | 17.173 |
| 44846.270833333336 | 17.137 |
| 44846.28125 | 17.166 |
| 44846.291666666664 | 17.14 |
| 44846.302083333336 | 17.163 |
| 44846.3125 | 17.15 |
| 44846.322916666664 | 17.073 |
| 44846.333333333336 | 17.088 |
| 44846.34375 | 17.116 |
| 44846.354166666664 | 17.05 |
| 44846.364583333336 | 17.081 |
| 44846.375 | 17.058 |
| 44846.385416666664 | 17.061 |
| 44846.395833333336 | 17.067 |
| 44846.40625 | 17.08 |
| 44846.416666666664 | 17.073 |
| 44846.427083333336 | 17.071 |
| 44846.4375 | 17.068 |
| 44846.447916666664 | 17.044 |
| 44846.458333333336 | 17.026 |
| 44846.46875 | 17.01 |
| 44846.479166666664 | 17.009 |
| 44846.489583333336 | 17.021 |
| 44846.5 | 17.028 |
| 44846.510416666664 | 17.056 |
| 44846.520833333336 | 17.11 |
| 44846.53125 | 17.209 |
| 44846.541666666664 | 17.322 |
| 44846.552083333336 | 17.407 |
| 44846.5625 | 17.517 |
| 44846.572916666664 | 17.649 |
| 44846.583333333336 | 17.68 |
| 44846.59375 | 17.743 |
| 44846.604166666664 | 17.814 |
| 44846.614583333336 | 17.853 |
| 44846.625 | 17.937 |
| 44846.635416666664 | 18.01 |
| 44846.645833333336 | 18.087 |
| 44846.65625 | 18.104 |
| 44846.666666666664 | 18.236 |
| 44846.677083333336 | 18.323 |
| 44846.6875 | 18.443 |
| 44846.697916666664 | 18.726 |
| 44846.708333333336 | 18.708 |
| 44846.71875 | 18.802 |
| 44846.729166666664 | 18.963 |
| 44846.739583333336 | 19.017 |
| 44846.75 | 19.391 |
| 44846.760416666664 | 19.242 |
| 44846.770833333336 | 19.412 |
| 44846.78125 | 19.4 |
| 44846.791666666664 | 19.504 |
| 44846.802083333336 | 19.55 |
| 44846.8125 | 19.607 |
| 44846.822916666664 | 19.642 |
| 44846.833333333336 | 19.749 |
| 44846.84375 | 19.712 |
| 44846.854166666664 | 19.812 |
| 44846.864583333336 | 19.727 |
| 44846.875 | 19.762 |
| 44846.885416666664 | 19.71 |
| 44846.895833333336 | 19.637 |
| 44846.90625 | 19.569 |
| 44846.916666666664 | 19.49 |
| 44846.927083333336 | 19.419 |
| 44846.9375 | 19.419 |
| 44846.947916666664 | 19.418 |
| 44846.958333333336 | 19.388 |
| 44846.96875 | 19.354 |
| 44846.979166666664 | 19.272 |
| 44846.989583333336 | 19.23 |
| 44847.0 | 19.197 |
| 44847.010416666664 | 19.179 |
| 44847.020833333336 | 19.144 |
| 44847.03125 | 19.113 |
| 44847.041666666664 | 19.104 |
| 44847.052083333336 | 19.078 |
| 44847.0625 | 19.067 |
| 44847.072916666664 | 19.058 |
| 44847.083333333336 | 19.042 |
| 44847.09375 | 19.038 |
| 44847.104166666664 | 19.029 |
| 44847.114583333336 | 19.027 |
| 44847.125 | 19.014 |
| 44847.135416666664 | 19.003 |
| 44847.145833333336 | 18.991 |
| 44847.15625 | 18.98 |
| 44847.166666666664 | 18.986 |
| 44847.177083333336 | 18.952 |
| 44847.1875 | 18.934 |
| 44847.197916666664 | 18.939 |
| 44847.208333333336 | 18.809 |
| 44847.21875 | 18.745 |
| 44847.229166666664 | 18.625 |
| 44847.239583333336 | 18.708 |
| 44847.25 | 18.567 |
| 44847.260416666664 | 18.546 |
| 44847.270833333336 | 18.546 |
| 44847.28125 | 18.561 |
| 44847.291666666664 | 18.552 |
| 44847.302083333336 | 18.557 |
| 44847.3125 | 18.535 |
| 44847.322916666664 | 18.542 |
| 44847.333333333336 | 18.542 |
| 44847.34375 | 18.553 |
| 44847.354166666664 | 18.565 |
| 44847.364583333336 | 18.573 |
| 44847.375 | 18.564 |
| 44847.385416666664 | 18.56 |
| 44847.395833333336 | 18.55 |
| 44847.40625 | 18.545 |
| 44847.416666666664 | 18.539 |
| 44847.427083333336 | 18.532 |
| 44847.4375 | 18.526 |
| 44847.447916666664 | 18.513 |
| 44847.458333333336 | 18.543 |
| 44847.46875 | 18.554 |
| 44847.479166666664 | 18.553 |
| 44847.489583333336 | 18.541 |
| 44847.5 | 18.542 |
| 44847.510416666664 | 18.548 |
| 44847.520833333336 | 18.557 |
| 44847.53125 | 18.564 |
| 44847.541666666664 | 18.586 |
| 44847.552083333336 | 18.602 |
| 44847.5625 | 18.625 |
| 44847.572916666664 | 18.642 |
| 44847.583333333336 | 18.669 |
| 44847.59375 | 18.697 |
| 44847.604166666664 | 18.736 |
| 44847.614583333336 | 18.76 |
| 44847.625 | 18.783 |
| 44847.635416666664 | 18.796 |
| 44847.645833333336 | 18.808 |
| 44847.65625 | 18.825 |
| 44847.666666666664 | 18.831 |
| 44847.677083333336 | 18.839 |
| 44847.6875 | 18.809 |
| 44847.697916666664 | 18.853 |
| 44847.708333333336 | 18.864 |
| 44847.71875 | 18.905 |
| 44847.729166666664 | 18.944 |
| 44847.739583333336 | 18.944 |
| 44847.75 | 18.997 |
| 44847.760416666664 | 19.039 |
| 44847.770833333336 | 19.142 |
| 44847.78125 | 19.136 |
| 44847.791666666664 | 19.21 |
| 44847.802083333336 | 19.249 |
| 44847.8125 | 19.28 |
| 44847.822916666664 | 19.404 |
| 44847.833333333336 | 19.312 |
| 44847.84375 | 19.351 |
| 44847.854166666664 | 19.435 |
| 44847.864583333336 | 19.464 |
| 44847.875 | 19.472 |
| 44847.885416666664 | 19.483 |
| 44847.895833333336 | 19.495 |
| 44847.90625 | 19.52 |
| 44847.916666666664 | 19.503 |
| 44847.927083333336 | 19.434 |
| 44847.9375 | 19.449 |
| 44847.947916666664 | 19.396 |
| 44847.958333333336 | 19.393 |
| 44847.96875 | 19.365 |
| 44847.979166666664 | 19.354 |
| 44847.989583333336 | 19.359 |
| 44848.0 | 19.335 |
| 44848.010416666664 | 19.316 |
| 44848.020833333336 | 19.296 |
| 44848.03125 | 19.271 |
| 44848.041666666664 | 19.26 |
| 44848.052083333336 | 19.246 |
| 44848.0625 | 19.232 |
| 44848.072916666664 | 19.215 |
| 44848.083333333336 | 19.205 |
| 44848.09375 | 19.194 |
| 44848.104166666664 | 19.183 |
| 44848.114583333336 | 19.178 |
| 44848.125 | 19.169 |
| 44848.135416666664 | 19.159 |
| 44848.145833333336 | 19.153 |
| 44848.15625 | 19.143 |
| 44848.166666666664 | 19.14 |
| 44848.177083333336 | 19.132 |
| 44848.1875 | 19.152 |
| 44848.197916666664 | 19.121 |
| 44848.208333333336 | 19.105 |
| 44848.21875 | 19.066 |
| 44848.229166666664 | 18.982 |
| 44848.239583333336 | 18.896 |
| 44848.25 | 18.853 |
| 44848.260416666664 | 18.71 |
| 44848.270833333336 | 18.672 |
| 44848.28125 | 18.664 |
| 44848.291666666664 | 18.49 |
| 44848.302083333336 | 18.465 |
| 44848.3125 | 18.474 |
| 44848.322916666664 | 18.36 |
| 44848.333333333336 | 18.328 |
| 44848.34375 | 18.337 |
| 44848.354166666664 | 18.331 |
| 44848.364583333336 | 18.322 |
| 44848.375 | 18.36 |
| 44848.385416666664 | 18.31 |
| 44848.395833333336 | 18.263 |
| 44848.40625 | 18.196 |
| 44848.416666666664 | 18.298 |
| 44848.427083333336 | 18.286 |
| 44848.4375 | 18.269 |
| 44848.447916666664 | 18.295 |
| 44848.458333333336 | 18.286 |
| 44848.46875 | 18.304 |
| 44848.479166666664 | 18.31 |
| 44848.489583333336 | 18.308 |
| 44848.5 | 18.299 |
| 44848.510416666664 | 18.286 |
| 44848.520833333336 | 18.27 |
| 44848.53125 | 18.257 |
| 44848.541666666664 | 18.24 |
| 44848.552083333336 | 18.238 |
| 44848.5625 | 18.234 |
| 44848.572916666664 | 18.233 |
| 44848.583333333336 | 18.235 |
| 44848.59375 | 18.252 |
| 44848.604166666664 | 18.251 |
| 44848.614583333336 | 18.274 |
| 44848.625 | 18.307 |
| 44848.635416666664 | 18.361 |
| 44848.645833333336 | 18.413 |
| 44848.65625 | 18.463 |
| 44848.666666666664 | 18.504 |
| 44848.677083333336 | 18.54 |
| 44848.6875 | 18.573 |
| 44848.697916666664 | 18.733 |
| 44848.708333333336 | 18.88 |
| 44848.71875 | 18.957 |
| 44848.729166666664 | 19.135 |
| 44848.739583333336 | 19.237 |
| 44848.75 | 19.21 |
| 44848.760416666664 | 19.195 |
| 44848.770833333336 | 19.204 |
| 44848.78125 | 19.339 |
| 44848.791666666664 | 19.457 |
| 44848.802083333336 | 19.545 |
| 44848.8125 | 19.717 |
| 44848.822916666664 | 19.622 |
| 44848.833333333336 | 19.774 |
| 44848.84375 | 19.929 |
| 44848.854166666664 | 19.939 |
| 44848.864583333336 | 20.113 |
| 44848.875 | 20.124 |
| 44848.885416666664 | 20.043 |
| 44848.895833333336 | 20.031 |
| 44848.90625 | 20.026 |
| 44848.916666666664 | 20.101 |
| 44848.927083333336 | 20.081 |
| 44848.9375 | 20.104 |
| 44848.947916666664 | 19.991 |
| 44848.958333333336 | 19.899 |
| 44848.96875 | 19.899 |
| 44848.979166666664 | 19.807 |
| 44848.989583333336 | 19.799 |
| 44849.0 | 19.746 |
| 44849.010416666664 | 19.705 |
| 44849.020833333336 | 19.649 |
| 44849.03125 | 19.624 |
| 44849.041666666664 | 19.543 |
| 44849.052083333336 | 19.413 |
| 44849.0625 | 19.303 |
| 44849.072916666664 | 19.252 |
| 44849.083333333336 | 19.216 |
| 44849.09375 | 19.187 |
| 44849.104166666664 | 19.182 |
| 44849.114583333336 | 19.155 |
| 44849.125 | 19.136 |
| 44849.135416666664 | 19.101 |
| 44849.145833333336 | 19.074 |
| 44849.15625 | 19.04 |
| 44849.166666666664 | 19.009 |
| 44849.177083333336 | 18.98 |
| 44849.1875 | 18.954 |
| 44849.197916666664 | 18.942 |
| 44849.208333333336 | 18.92 |
| 44849.21875 | 18.898 |
| 44849.229166666664 | 18.817 |
| 44849.239583333336 | 18.685 |
| 44849.25 | 18.688 |
| 44849.260416666664 | 18.615 |
| 44849.270833333336 | 18.358 |
| 44849.28125 | 18.268 |
| 44849.291666666664 | 18.145 |
| 44849.302083333336 | 17.933 |
| 44849.3125 | 17.876 |
| 44849.322916666664 | 17.928 |
| 44849.333333333336 | 17.825 |
| 44849.34375 | 17.794 |
| 44849.354166666664 | 17.625 |
| 44849.364583333336 | 17.531 |
| 44849.375 | 17.483 |
| 44849.385416666664 | 17.396 |
| 44849.395833333336 | 17.304 |
| 44849.40625 | 17.315 |
| 44849.416666666664 | 17.327 |
| 44849.427083333336 | 17.247 |
| 44849.4375 | 17.235 |
| 44849.447916666664 | 17.253 |
| 44849.458333333336 | 17.233 |
| 44849.46875 | 17.191 |
| 44849.479166666664 | 17.239 |
| 44849.489583333336 | 17.259 |
| 44849.5 | 17.26 |
| 44849.510416666664 | 17.275 |
| 44849.520833333336 | 17.256 |
| 44849.53125 | 17.327 |
| 44849.541666666664 | 17.442 |
| 44849.552083333336 | 17.528 |
| 44849.5625 | 17.61 |
| 44849.572916666664 | 17.643 |
| 44849.583333333336 | 17.686 |
| 44849.59375 | 17.764 |
| 44849.604166666664 | 17.851 |
| 44849.614583333336 | 17.927 |
| 44849.625 | 17.994 |
| 44849.635416666664 | 18.058 |
| 44849.645833333336 | 18.132 |
| 44849.65625 | 18.18 |
| 44849.666666666664 | 18.248 |
| 44849.677083333336 | 18.434 |
| 44849.6875 | 18.515 |
| 44849.697916666664 | 18.587 |
| 44849.708333333336 | 18.713 |
| 44849.71875 | 18.779 |
| 44849.729166666664 | 18.848 |
| 44849.739583333336 | 18.89 |
| 44849.75 | 18.892 |
| 44849.760416666664 | 18.903 |
| 44849.770833333336 | 19.109 |
| 44849.78125 | 19.424 |
| 44849.791666666664 | 19.669 |
| 44849.802083333336 | 19.733 |
| 44849.8125 | 19.768 |
| 44849.822916666664 | 19.859 |
| 44849.833333333336 | 19.861 |
| 44849.84375 | 19.931 |
| 44849.854166666664 | 19.987 |
| 44849.864583333336 | 19.91 |
| 44849.875 | 19.895 |
| 44849.885416666664 | 19.852 |
| 44849.895833333336 | 19.87 |
| 44849.90625 | 19.827 |
| 44849.916666666664 | 19.793 |
| 44849.927083333336 | 19.784 |
| 44849.9375 | 19.71 |
| 44849.947916666664 | 19.622 |
| 44849.958333333336 | 19.488 |
| 44849.96875 | 19.443 |
| 44849.979166666664 | 19.396 |
| 44849.989583333336 | 19.374 |
| 44850.0 | 19.395 |
| 44850.010416666664 | 19.433 |
| 44850.020833333336 | 19.428 |
| 44850.03125 | 19.399 |
| 44850.041666666664 | 19.381 |
| 44850.052083333336 | 19.347 |
| 44850.0625 | 19.29 |
| 44850.072916666664 | 19.247 |
| 44850.083333333336 | 19.2 |
| 44850.09375 | 19.119 |
| 44850.104166666664 | 19.021 |
| 44850.114583333336 | 18.987 |
| 44850.125 | 18.959 |
| 44850.135416666664 | 18.926 |
| 44850.145833333336 | 18.906 |
| 44850.15625 | 18.863 |
| 44850.166666666664 | 18.818 |
| 44850.177083333336 | 18.794 |
| 44850.1875 | 18.761 |
| 44850.197916666664 | 18.728 |
| 44850.208333333336 | 18.692 |
| 44850.21875 | 18.655 |
| 44850.229166666664 | 18.652 |
| 44850.239583333336 | 18.685 |
| 44850.25 | 18.637 |
| 44850.260416666664 | 18.58 |
| 44850.270833333336 | 18.479 |
| 44850.28125 | 18.329 |
| 44850.291666666664 | 18.223 |
| 44850.302083333336 | 18.142 |
| 44850.3125 | 18.131 |
| 44850.322916666664 | 18.273 |
| 44850.333333333336 | 18.208 |
| 44850.34375 | 18.182 |
| 44850.354166666664 | 18.096 |
| 44850.364583333336 | 18.005 |
| 44850.375 | 17.906 |
| 44850.385416666664 | 17.964 |
| 44850.395833333336 | 17.934 |
| 44850.40625 | 17.958 |
| 44850.416666666664 | 17.945 |
| 44850.427083333336 | 17.897 |
| 44850.4375 | 17.842 |
| 44850.447916666664 | 17.798 |
| 44850.458333333336 | 17.721 |
| 44850.46875 | 17.676 |
| 44850.479166666664 | 17.668 |
| 44850.489583333336 | 17.658 |
| 44850.5 | 17.665 |
| 44850.510416666664 | 17.674 |
| 44850.520833333336 | 17.714 |
| 44850.53125 | 17.773 |
| 44850.541666666664 | 17.763 |
| 44850.552083333336 | 17.831 |
| 44850.5625 | 17.86 |
| 44850.572916666664 | 17.895 |
| 44850.583333333336 | 17.922 |
| 44850.59375 | 17.966 |
| 44850.604166666664 | 18.027 |
| 44850.614583333336 | 18.068 |
| 44850.625 | 18.096 |
| 44850.635416666664 | 18.125 |
| 44850.645833333336 | 18.16 |
| 44850.65625 | 18.204 |
| 44850.666666666664 | 18.241 |
| 44850.677083333336 | 18.309 |
| 44850.6875 | 18.367 |
| 44850.697916666664 | 18.415 |
| 44850.708333333336 | 18.491 |
| 44850.71875 | 18.574 |
| 44850.729166666664 | 18.658 |
| 44850.739583333336 | 18.748 |
| 44850.75 | 18.884 |
| 44850.760416666664 | 18.941 |
| 44850.770833333336 | 18.989 |
| 44850.78125 | 19.039 |
| 44850.791666666664 | 19.124 |
| 44850.802083333336 | 19.338 |
| 44850.8125 | 19.389 |
| 44850.822916666664 | 19.469 |
| 44850.833333333336 | 19.692 |
| 44850.84375 | 19.426 |
| 44850.854166666664 | 19.442 |
| 44850.864583333336 | 19.313 |
| 44850.875 | 19.428 |
| 44850.885416666664 | 19.473 |
| 44850.895833333336 | 19.435 |
| 44850.90625 | 19.505 |
| 44850.916666666664 | 19.496 |
| 44850.927083333336 | 19.525 |
| 44850.9375 | 19.457 |
| 44850.947916666664 | 19.484 |
| 44850.958333333336 | 19.497 |
| 44850.96875 | 19.53 |
| 44850.979166666664 | 19.55 |
| 44850.989583333336 | 19.5 |
| 44851.0 | 19.485 |
| 44851.010416666664 | 19.404 |
| 44851.020833333336 | 19.356 |
| 44851.03125 | 19.34 |
| 44851.041666666664 | 19.323 |
| 44851.052083333336 | 19.318 |
| 44851.0625 | 19.351 |
| 44851.072916666664 | 19.338 |
| 44851.083333333336 | 19.325 |
| 44851.09375 | 19.323 |
| 44851.104166666664 | 19.302 |
| 44851.114583333336 | 19.258 |
| 44851.125 | 19.225 |
| 44851.135416666664 | 19.177 |
| 44851.145833333336 | 19.093 |
| 44851.15625 | 19.05 |
| 44851.166666666664 | 19.008 |
| 44851.177083333336 | 18.979 |
| 44851.1875 | 18.941 |
| 44851.197916666664 | 18.921 |
| 44851.208333333336 | 18.914 |
| 44851.21875 | 18.909 |
| 44851.229166666664 | 18.889 |
| 44851.239583333336 | 18.898 |
| 44851.25 | 18.908 |
| 44851.260416666664 | 18.803 |
| 44851.270833333336 | 18.823 |
| 44851.28125 | 18.789 |
| 44851.291666666664 | 18.841 |
| 44851.302083333336 | 18.829 |
| 44851.3125 | 18.612 |
| 44851.322916666664 | 18.219 |
| 44851.333333333336 | 17.698 |
| 44851.34375 | 18.438 |
| 44851.354166666664 | 18.585 |
| 44851.364583333336 | 18.418 |
| 44851.375 | 18.56 |
| 44851.385416666664 | 18.387 |
| 44851.395833333336 | 18.12 |
| 44851.40625 | 18.344 |
| 44851.416666666664 | 18.415 |
| 44851.427083333336 | 18.413 |
| 44851.4375 | 18.09 |
| 44851.447916666664 | 18.004 |
| 44851.458333333336 | 17.884 |
| 44851.46875 | 17.6 |
| 44851.479166666664 | 17.588 |
| 44851.489583333336 | 17.541 |
| 44851.5 | 17.686 |
| 44851.510416666664 | 17.811 |
| 44851.520833333336 | 17.857 |
| 44851.53125 | 17.902 |
| 44851.541666666664 | 18.004 |
| 44851.552083333336 | 18.084 |
| 44851.5625 | 18.195 |
| 44851.572916666664 | 18.191 |
| 44851.583333333336 | 18.214 |
| 44851.59375 | 18.263 |
| 44851.604166666664 | 18.353 |
| 44851.614583333336 | 18.403 |
| 44851.625 | 18.355 |
| 44851.635416666664 | 18.389 |
| 44851.645833333336 | 18.421 |
| 44851.65625 | 18.426 |
| 44851.666666666664 | 18.439 |
| 44851.677083333336 | 18.452 |
| 44851.6875 | 18.461 |
| 44851.697916666664 | 18.494 |
| 44851.708333333336 | 18.512 |
| 44851.71875 | 18.538 |
| 44851.729166666664 | 18.559 |
| 44851.739583333336 | 18.578 |
| 44851.75 | 18.604 |
| 44851.760416666664 | 18.62 |
| 44851.770833333336 | 18.648 |
| 44851.78125 | 18.696 |
| 44851.791666666664 | 18.714 |
| 44851.802083333336 | 18.774 |
| 44851.8125 | 18.785 |
| 44851.822916666664 | 18.842 |
| 44851.833333333336 | 18.948 |
| 44851.84375 | 18.993 |
| 44851.854166666664 | 19.051 |
| 44851.864583333336 | 19.158 |
| 44851.875 | 19.262 |
| 44851.885416666664 | 19.256 |
| 44851.895833333336 | 19.555 |
| 44851.90625 | 19.572 |
| 44851.916666666664 | 19.668 |
| 44851.927083333336 | 19.669 |
| 44851.9375 | 19.712 |
| 44851.947916666664 | 19.363 |
| 44851.958333333336 | 19.354 |
| 44851.96875 | 19.325 |
| 44851.979166666664 | 19.384 |
| 44851.989583333336 | 19.409 |
| 44852.0 | 19.407 |
| 44852.010416666664 | 19.42 |
| 44852.020833333336 | 19.412 |
| 44852.03125 | 19.413 |
| 44852.041666666664 | 19.397 |
| 44852.052083333336 | 19.372 |
| 44852.0625 | 19.351 |
| 44852.072916666664 | 19.357 |
| 44852.083333333336 | 19.342 |
| 44852.09375 | 19.307 |
| 44852.104166666664 | 19.307 |
| 44852.114583333336 | 19.301 |
| 44852.125 | 19.28 |
| 44852.135416666664 | 19.258 |
| 44852.145833333336 | 19.213 |
| 44852.15625 | 19.133 |
| 44852.166666666664 | 19.085 |
| 44852.177083333336 | 18.999 |
| 44852.1875 | 18.917 |
| 44852.197916666664 | 18.843 |
| 44852.208333333336 | 18.791 |
| 44852.21875 | 18.731 |
| 44852.229166666664 | 18.712 |
| 44852.239583333336 | 18.693 |
| 44852.25 | 18.668 |
| 44852.260416666664 | 18.648 |
| 44852.270833333336 | 18.644 |
| 44852.28125 | 18.587 |
| 44852.291666666664 | 18.58 |
| 44852.302083333336 | 18.554 |
| 44852.3125 | 18.53 |
| 44852.322916666664 | 18.482 |
| 44852.333333333336 | 18.43 |
| 44852.34375 | 18.406 |
| 44852.354166666664 | 18.447 |
| 44852.364583333336 | 18.346 |
| 44852.375 | 18.329 |
| 44852.385416666664 | 18.14 |
| 44852.395833333336 | 18.072 |
| 44852.40625 | 18.026 |
| 44852.416666666664 | 17.858 |
| 44852.427083333336 | 17.705 |
| 44852.4375 | 17.558 |
| 44852.447916666664 | 17.542 |
| 44852.458333333336 | 17.4 |
| 44852.46875 | 17.299 |
| 44852.479166666664 | 17.219 |
| 44852.489583333336 | 17.172 |
| 44852.5 | 17.108 |
| 44852.510416666664 | 17.032 |
| 44852.520833333336 | 16.973 |
| 44852.53125 | 16.959 |
| 44852.541666666664 | 16.98 |
| 44852.552083333336 | 16.986 |
| 44852.5625 | 17.016 |
| 44852.572916666664 | 17.002 |
| 44852.583333333336 | 17.017 |
| 44852.59375 | 17.068 |
| 44852.604166666664 | 17.181 |
| 44852.614583333336 | 17.272 |
| 44852.625 | 17.366 |
| 44852.635416666664 | 17.473 |
| 44852.645833333336 | 17.524 |
| 44852.65625 | 17.598 |
| 44852.666666666664 | 17.651 |
| 44852.677083333336 | 17.698 |
| 44852.6875 | 17.729 |
| 44852.697916666664 | 17.792 |
| 44852.708333333336 | 17.836 |
| 44852.71875 | 17.864 |
| 44852.729166666664 | 17.898 |
| 44852.739583333336 | 17.936 |
| 44852.75 | 17.958 |
| 44852.760416666664 | 17.995 |
| 44852.770833333336 | 18.016 |
| 44852.78125 | 18.036 |
| 44852.791666666664 | 18.052 |
| 44852.802083333336 | 18.065 |
| 44852.8125 | 18.071 |
| 44852.822916666664 | 18.051 |
| 44852.833333333336 | 18.052 |
| 44852.84375 | 18.063 |
| 44852.854166666664 | 18.068 |
| 44852.864583333336 | 18.091 |
| 44852.875 | 18.075 |
| 44852.885416666664 | 18.096 |
| 44852.895833333336 | 18.126 |
| 44852.90625 | 18.112 |
| 44852.916666666664 | 18.127 |
| 44852.927083333336 | 18.139 |
| 44852.9375 | 18.063 |
| 44852.947916666664 | 18.026 |
| 44852.958333333336 | 18.009 |
| 44852.96875 | 17.932 |
| 44852.979166666664 | 17.844 |
| 44852.989583333336 | 17.771 |
| 44853.0 | 17.652 |
| 44853.010416666664 | 17.563 |
| 44853.020833333336 | 17.438 |
| 44853.03125 | 17.328 |
| 44853.041666666664 | 17.235 |
| 44853.052083333336 | 17.147 |
| 44853.0625 | 17.009 |
| 44853.072916666664 | 16.978 |
| 44853.083333333336 | 16.927 |
| 44853.09375 | 16.828 |
| 44853.104166666664 | 16.847 |
| 44853.114583333336 | 16.835 |
| 44853.125 | 16.857 |
| 44853.135416666664 | 16.827 |
| 44853.145833333336 | 16.86 |
| 44853.15625 | 16.903 |
| 44853.166666666664 | 16.943 |
| 44853.177083333336 | 16.958 |
| 44853.1875 | 16.964 |
| 44853.197916666664 | 17.037 |
| 44853.208333333336 | 17.037 |
| 44853.21875 | 16.955 |
| 44853.229166666664 | 16.882 |
| 44853.239583333336 | 16.868 |
| 44853.25 | 16.852 |
| 44853.260416666664 | 16.822 |
| 44853.270833333336 | 16.802 |
| 44853.28125 | 16.774 |
| 44853.291666666664 | 16.738 |
| 44853.302083333336 | 16.706 |
| 44853.3125 | 16.666 |
| 44853.322916666664 | 16.626 |
| 44853.333333333336 | 16.616 |
| 44853.34375 | 16.581 |
| 44853.354166666664 | 16.568 |
| 44853.364583333336 | 16.502 |
| 44853.375 | 16.456 |
| 44853.385416666664 | 16.33 |
| 44853.395833333336 | 16.179 |
| 44853.40625 | 16.141 |
| 44853.416666666664 | 16.121 |
| 44853.427083333336 | 16.04 |
| 44853.4375 | 15.56 |
| 44853.447916666664 | 15.288 |
| 44853.458333333336 | 15.714 |
| 44853.46875 | 15.221 |
| 44853.479166666664 | 15.296 |
| 44853.489583333336 | 14.903 |
| 44853.5 | 14.818 |
| 44853.510416666664 | 14.596 |
| 44853.520833333336 | 14.385 |
| 44853.53125 | 14.125 |
| 44853.541666666664 | 14.077 |
| 44853.552083333336 | 14.051 |
| 44853.5625 | 14.079 |
| 44853.572916666664 | 14.072 |
| 44853.583333333336 | 14.067 |
| 44853.59375 | 14.069 |
| 44853.604166666664 | 14.094 |
| 44853.614583333336 | 14.214 |
| 44853.625 | 14.238 |
| 44853.635416666664 | 14.313 |
| 44853.645833333336 | 14.388 |
| 44853.65625 | 14.478 |
| 44853.666666666664 | 14.542 |
| 44853.677083333336 | 14.627 |
| 44853.6875 | 14.893 |
| 44853.697916666664 | 15.187 |
| 44853.708333333336 | 15.504 |
| 44853.71875 | 15.719 |
| 44853.729166666664 | 15.791 |
| 44853.739583333336 | 15.973 |
| 44853.75 | 16.064 |
| 44853.760416666664 | 16.163 |
| 44853.770833333336 | 16.227 |
| 44853.78125 | 16.297 |
| 44853.791666666664 | 16.358 |
| 44853.802083333336 | 16.414 |
| 44853.8125 | 16.477 |
| 44853.822916666664 | 16.506 |
| 44853.833333333336 | 16.528 |
| 44853.84375 | 16.539 |
| 44853.854166666664 | 16.555 |
| 44853.864583333336 | 16.549 |
| 44853.875 | 16.55 |
| 44853.885416666664 | 16.6 |
| 44853.895833333336 | 16.627 |
| 44853.90625 | 16.592 |
| 44853.916666666664 | 16.555 |
| 44853.927083333336 | 16.458 |
| 44853.9375 | 16.421 |
| 44853.947916666664 | 16.361 |
| 44853.958333333336 | 16.342 |
| 44853.96875 | 16.28 |
| 44853.979166666664 | 16.165 |
| 44853.989583333336 | 16.045 |
| 44854.0 | 16.072 |
| 44854.010416666664 | 15.925 |
| 44854.020833333336 | 15.738 |
| 44854.03125 | 15.531 |
| 44854.041666666664 | 15.388 |
| 44854.052083333336 | 15.196 |
| 44854.0625 | 15.041 |
| 44854.072916666664 | 14.963 |
| 44854.083333333336 | 14.884 |
| 44854.09375 | 14.83 |
| 44854.104166666664 | 14.775 |
| 44854.114583333336 | 14.701 |
| 44854.125 | 14.674 |
| 44854.135416666664 | 14.623 |
| 44854.145833333336 | 14.634 |
| 44854.15625 | 14.603 |
| 44854.166666666664 | 14.64 |
| 44854.177083333336 | 14.634 |
| 44854.1875 | 14.676 |
| 44854.197916666664 | 14.74 |
| 44854.208333333336 | 14.812 |
| 44854.21875 | 14.824 |
| 44854.229166666664 | 14.958 |
| 44854.239583333336 | 15.047 |
| 44854.25 | 15.057 |
| 44854.260416666664 | 15.042 |
| 44854.270833333336 | 14.928 |
| 44854.28125 | 14.864 |
| 44854.291666666664 | 14.871 |
| 44854.302083333336 | 14.844 |
| 44854.3125 | 14.818 |
| 44854.322916666664 | 14.784 |
| 44854.333333333336 | 14.767 |
| 44854.34375 | 14.746 |
| 44854.354166666664 | 14.729 |
| 44854.364583333336 | 14.716 |
| 44854.375 | 14.676 |
| 44854.385416666664 | 14.67 |
| 44854.395833333336 | 14.66 |
| 44854.40625 | 14.662 |
| 44854.416666666664 | 14.656 |
| 44854.427083333336 | 14.618 |
| 44854.4375 | 14.416 |
| 44854.447916666664 | 14.196 |
| 44854.458333333336 | 14.041 |
| 44854.46875 | 13.902 |
| 44854.479166666664 | 13.719 |
| 44854.489583333336 | 13.806 |
| 44854.5 | 13.517 |
| 44854.510416666664 | 13.357 |
| 44854.520833333336 | 13.46 |
| 44854.53125 | 13.421 |
| 44854.541666666664 | 13.241 |
| 44854.552083333336 | 13.134 |
| 44854.5625 | 13.126 |
| 44854.572916666664 | 13.134 |
| 44854.583333333336 | 13.171 |
| 44854.59375 | 13.21 |
| 44854.604166666664 | 13.246 |
| 44854.614583333336 | 13.305 |
| 44854.625 | 13.383 |
| 44854.635416666664 | 13.429 |
| 44854.645833333336 | 13.468 |
| 44854.65625 | 13.616 |
| 44854.666666666664 | 13.663 |
| 44854.677083333336 | 13.706 |
| 44854.6875 | 13.729 |
| 44854.697916666664 | 13.757 |
| 44854.708333333336 | 13.857 |
| 44854.71875 | 14.132 |
| 44854.729166666664 | 14.566 |
| 44854.739583333336 | 14.902 |
| 44854.75 | 15.024 |
| 44854.760416666664 | 15.183 |
| 44854.770833333336 | 15.331 |
| 44854.78125 | 15.496 |
| 44854.791666666664 | 15.575 |
| 44854.802083333336 | 15.614 |
| 44854.8125 | 15.705 |
| 44854.822916666664 | 15.732 |
| 44854.833333333336 | 15.799 |
| 44854.84375 | 15.813 |
| 44854.854166666664 | 15.807 |
| 44854.864583333336 | 15.807 |
| 44854.875 | 15.822 |
| 44854.885416666664 | 15.824 |
| 44854.895833333336 | 15.832 |
| 44854.90625 | 15.804 |
| 44854.916666666664 | 15.798 |
| 44854.927083333336 | 15.787 |
| 44854.9375 | 15.642 |
| 44854.947916666664 | 15.648 |
| 44854.958333333336 | 15.587 |
| 44854.96875 | 15.697 |
| 44854.979166666664 | 15.566 |
| 44854.989583333336 | 15.537 |
| 44855.0 | 15.352 |
| 44855.010416666664 | 15.261 |
| 44855.020833333336 | 15.2 |
| 44855.03125 | 15.11 |
| 44855.041666666664 | 15.118 |
| 44855.052083333336 | 15.064 |
| 44855.0625 | 14.96 |
| 44855.072916666664 | 14.854 |
| 44855.083333333336 | 14.741 |
| 44855.09375 | 14.671 |
| 44855.104166666664 | 14.619 |
| 44855.114583333336 | 14.572 |
| 44855.125 | 14.51 |
| 44855.135416666664 | 14.482 |
| 44855.145833333336 | 14.412 |
| 44855.15625 | 14.36 |
| 44855.166666666664 | 14.35 |
| 44855.177083333336 | 14.328 |
| 44855.1875 | 14.326 |
| 44855.197916666664 | 14.315 |
| 44855.208333333336 | 14.315 |
| 44855.21875 | 14.357 |
| 44855.229166666664 | 14.397 |
| 44855.239583333336 | 14.401 |
| 44855.25 | 14.469 |
| 44855.260416666664 | 14.523 |
| 44855.270833333336 | 14.604 |
| 44855.28125 | 14.636 |
| 44855.291666666664 | 14.646 |
| 44855.302083333336 | 14.67 |
| 44855.3125 | 14.665 |
| 44855.322916666664 | 14.667 |
| 44855.333333333336 | 14.653 |
| 44855.34375 | 14.618 |
| 44855.354166666664 | 14.605 |
| 44855.364583333336 | 14.595 |
| 44855.375 | 14.594 |
| 44855.385416666664 | 14.591 |
| 44855.395833333336 | 14.581 |
| 44855.40625 | 14.574 |
| 44855.416666666664 | 14.573 |
| 44855.427083333336 | 14.559 |
| 44855.4375 | 14.548 |
| 44855.447916666664 | 14.517 |
| 44855.458333333336 | 14.402 |
| 44855.46875 | 14.306 |
| 44855.479166666664 | 14.17 |
| 44855.489583333336 | 13.942 |
| 44855.5 | 13.68 |
| 44855.510416666664 | 13.757 |
| 44855.520833333336 | 13.36 |
| 44855.53125 | 13.3 |
| 44855.541666666664 | 13.197 |
| 44855.552083333336 | 13.528 |
| 44855.5625 | 13.317 |
| 44855.572916666664 | 13.302 |
| 44855.583333333336 | 13.304 |
| 44855.59375 | 13.364 |
| 44855.604166666664 | 13.4 |
| 44855.614583333336 | 13.444 |
| 44855.625 | 13.454 |
| 44855.635416666664 | 13.521 |
| 44855.645833333336 | 13.643 |
| 44855.65625 | 13.783 |
| 44855.666666666664 | 13.896 |
| 44855.677083333336 | 14.097 |
| 44855.6875 | 14.128 |
| 44855.697916666664 | 14.399 |
| 44855.708333333336 | 14.172 |
| 44855.71875 | 14.252 |
| 44855.729166666664 | 14.26 |
| 44855.739583333336 | 14.234 |
| 44855.75 | 14.395 |
| 44855.760416666664 | 14.334 |
| 44855.770833333336 | 14.617 |
| 44855.78125 | 15.043 |
| 44855.791666666664 | 15.433 |
| 44855.802083333336 | 15.62 |
| 44855.8125 | 15.81 |
| 44855.822916666664 | 16.11 |
| 44855.833333333336 | 16.278 |
| 44855.84375 | 16.42 |
| 44855.854166666664 | 16.486 |
| 44855.864583333336 | 16.594 |
| 44855.875 | 16.637 |
| 44855.885416666664 | 16.625 |
| 44855.895833333336 | 16.601 |
| 44855.90625 | 16.563 |
| 44855.916666666664 | 16.526 |
| 44855.927083333336 | 16.501 |
| 44855.9375 | 16.471 |
| 44855.947916666664 | 16.434 |
| 44855.958333333336 | 16.38 |
| 44855.96875 | 16.341 |
| 44855.979166666664 | 16.295 |
| 44855.989583333336 | 16.22 |
| 44856.0 | 16.188 |
| 44856.010416666664 | 16.157 |
| 44856.020833333336 | 16.147 |
| 44856.03125 | 16.03 |
| 44856.041666666664 | 15.919 |
| 44856.052083333336 | 15.855 |
| 44856.0625 | 15.731 |
| 44856.072916666664 | 15.67 |
| 44856.083333333336 | 15.622 |
| 44856.09375 | 15.539 |
| 44856.104166666664 | 15.452 |
| 44856.114583333336 | 15.361 |
| 44856.125 | 15.307 |
| 44856.135416666664 | 15.231 |
| 44856.145833333336 | 15.186 |
| 44856.15625 | 15.158 |
| 44856.166666666664 | 15.111 |
| 44856.177083333336 | 15.093 |
| 44856.1875 | 15.063 |
| 44856.197916666664 | 15.023 |
| 44856.208333333336 | 15.025 |
| 44856.21875 | 15.009 |
| 44856.229166666664 | 15.011 |
| 44856.239583333336 | 15.038 |
| 44856.25 | 15.058 |
| 44856.260416666664 | 15.087 |
| 44856.270833333336 | 15.133 |
| 44856.28125 | 15.157 |
| 44856.291666666664 | 15.232 |
| 44856.302083333336 | 15.258 |
| 44856.3125 | 15.263 |
| 44856.322916666664 | 15.239 |
| 44856.333333333336 | 15.226 |
| 44856.34375 | 15.225 |
| 44856.354166666664 | 15.227 |
| 44856.364583333336 | 15.22 |
| 44856.375 | 15.223 |
| 44856.385416666664 | 15.22 |
| 44856.395833333336 | 15.216 |
| 44856.40625 | 15.187 |
| 44856.416666666664 | 15.146 |
| 44856.427083333336 | 15.102 |
| 44856.4375 | 15.05 |
| 44856.447916666664 | 15.017 |
| 44856.458333333336 | 14.979 |
| 44856.46875 | 14.971 |
| 44856.479166666664 | 14.949 |
| 44856.489583333336 | 14.962 |
| 44856.5 | 14.94 |
| 44856.510416666664 | 14.898 |
| 44856.520833333336 | 14.75 |
| 44856.53125 | 14.609 |
| 44856.541666666664 | 14.417 |
| 44856.552083333336 | 14.339 |
| 44856.5625 | 14.237 |
| 44856.572916666664 | 14.52 |
| 44856.583333333336 | 14.154 |
| 44856.59375 | 14.363 |
| 44856.604166666664 | 14.333 |
| 44856.614583333336 | 14.45 |
| 44856.625 | 14.573 |
| 44856.635416666664 | 14.629 |
| 44856.645833333336 | 14.703 |
| 44856.65625 | 14.819 |
| 44856.666666666664 | 14.875 |
| 44856.677083333336 | 14.973 |
| 44856.6875 | 15.11 |
| 44856.697916666664 | 15.211 |
| 44856.708333333336 | 15.266 |
| 44856.71875 | 15.249 |
| 44856.729166666664 | 15.325 |
| 44856.739583333336 | 15.372 |
| 44856.75 | 15.352 |
| 44856.760416666664 | 15.331 |
| 44856.770833333336 | 15.317 |
| 44856.78125 | 15.345 |
| 44856.791666666664 | 15.418 |
| 44856.802083333336 | 15.456 |
| 44856.8125 | 15.635 |
| 44856.822916666664 | 15.699 |
| 44856.833333333336 | 15.825 |
| 44856.84375 | 15.988 |
| 44856.854166666664 | 16.098 |
| 44856.864583333336 | 16.189 |
| 44856.875 | 16.292 |
| 44856.885416666664 | 16.356 |
| 44856.895833333336 | 16.403 |
| 44856.90625 | 16.418 |
| 44856.916666666664 | 16.419 |
| 44856.927083333336 | 16.415 |
| 44856.9375 | 16.409 |
| 44856.947916666664 | 16.392 |
| 44856.958333333336 | 16.366 |
| 44856.96875 | 16.325 |
| 44856.979166666664 | 16.28 |
| 44856.989583333336 | 16.251 |
| 44857.0 | 16.21 |
| 44857.010416666664 | 16.189 |
| 44857.020833333336 | 16.174 |
| 44857.03125 | 16.141 |
| 44857.041666666664 | 16.123 |
| 44857.052083333336 | 16.111 |
| 44857.0625 | 16.044 |
| 44857.072916666664 | 15.949 |
| 44857.083333333336 | 15.92 |
| 44857.09375 | 15.838 |
| 44857.104166666664 | 15.787 |
| 44857.114583333336 | 15.718 |
| 44857.125 | 15.671 |
| 44857.135416666664 | 15.705 |
| 44857.145833333336 | 15.624 |
| 44857.15625 | 15.647 |
| 44857.166666666664 | 15.69 |
| 44857.177083333336 | 15.66 |
| 44857.1875 | 15.663 |
| 44857.197916666664 | 15.642 |
| 44857.208333333336 | 15.658 |
| 44857.21875 | 15.644 |
| 44857.229166666664 | 15.668 |
| 44857.239583333336 | 15.663 |
| 44857.25 | 15.647 |
| 44857.260416666664 | 15.625 |
| 44857.270833333336 | 15.629 |
| 44857.28125 | 15.629 |
| 44857.291666666664 | 15.624 |
| 44857.302083333336 | 15.621 |
| 44857.3125 | 15.616 |
| 44857.322916666664 | 15.561 |
| 44857.333333333336 | 15.504 |
| 44857.34375 | 15.489 |
| 44857.354166666664 | 15.497 |
| 44857.364583333336 | 15.492 |
| 44857.375 | 15.482 |
| 44857.385416666664 | 15.469 |
| 44857.395833333336 | 15.466 |
| 44857.40625 | 15.47 |
| 44857.416666666664 | 15.464 |
| 44857.427083333336 | 15.446 |
| 44857.4375 | 15.408 |
| 44857.447916666664 | 15.38 |
| 44857.458333333336 | 15.368 |
| 44857.46875 | 15.362 |
| 44857.479166666664 | 15.363 |
| 44857.489583333336 | 15.362 |
| 44857.5 | 15.367 |
| 44857.510416666664 | 15.37 |
| 44857.520833333336 | 15.398 |
| 44857.53125 | 15.408 |
| 44857.541666666664 | 15.383 |
| 44857.552083333336 | 15.375 |
| 44857.5625 | 15.373 |
| 44857.572916666664 | 15.372 |
| 44857.583333333336 | 15.379 |
| 44857.59375 | 15.387 |
| 44857.604166666664 | 15.434 |
| 44857.614583333336 | 15.421 |
| 44857.625 | 15.459 |
| 44857.635416666664 | 15.493 |
| 44857.645833333336 | 15.564 |
| 44857.65625 | 15.621 |
| 44857.666666666664 | 15.689 |
| 44857.677083333336 | 15.743 |
| 44857.6875 | 15.805 |
| 44857.697916666664 | 15.837 |
| 44857.708333333336 | 15.878 |
| 44857.71875 | 15.939 |
| 44857.729166666664 | 15.978 |
| 44857.739583333336 | 15.985 |
| 44857.75 | 15.947 |
| 44857.760416666664 | 15.911 |
| 44857.770833333336 | 15.921 |
| 44857.78125 | 15.914 |
| 44857.791666666664 | 15.898 |
| 44857.802083333336 | 15.884 |
| 44857.8125 | 15.871 |
| 44857.822916666664 | 15.856 |
| 44857.833333333336 | 15.854 |
| 44857.84375 | 15.853 |
| 44857.854166666664 | 15.855 |
| 44857.864583333336 | 15.859 |
| 44857.875 | 15.863 |
| 44857.885416666664 | 15.859 |
| 44857.895833333336 | 15.859 |
| 44857.90625 | 15.859 |
| 44857.916666666664 | 15.861 |
| 44857.927083333336 | 15.868 |
| 44857.9375 | 15.858 |
| 44857.947916666664 | 15.854 |
| 44857.958333333336 | 15.848 |
| 44857.96875 | 15.839 |
| 44857.979166666664 | 15.835 |
| 44857.989583333336 | 15.831 |
| 44858.0 | 15.83 |
| 44858.010416666664 | 15.835 |
| 44858.020833333336 | 15.845 |
| 44858.03125 | 15.85 |
| 44858.041666666664 | 15.859 |
| 44858.052083333336 | 15.864 |
| 44858.0625 | 15.871 |
| 44858.072916666664 | 15.866 |
| 44858.083333333336 | 15.858 |
| 44858.09375 | 15.858 |
| 44858.104166666664 | 15.842 |
| 44858.114583333336 | 15.838 |
| 44858.125 | 15.839 |
| 44858.135416666664 | 15.844 |
| 44858.145833333336 | 15.85 |
| 44858.15625 | 15.882 |
| 44858.166666666664 | 15.881 |
| 44858.177083333336 | 15.889 |
| 44858.1875 | 15.889 |
| 44858.197916666664 | 15.885 |
| 44858.208333333336 | 15.889 |
| 44858.21875 | 15.889 |
| 44858.229166666664 | 15.883 |
| 44858.239583333336 | 15.884 |
| 44858.25 | 15.874 |
| 44858.260416666664 | 15.863 |
| 44858.270833333336 | 15.866 |
| 44858.28125 | 15.865 |
| 44858.291666666664 | 15.871 |
| 44858.302083333336 | 15.853 |
| 44858.3125 | 15.861 |
| 44858.322916666664 | 15.859 |
| 44858.333333333336 | 15.855 |
| 44858.34375 | 15.842 |
| 44858.354166666664 | 15.792 |
| 44858.364583333336 | 15.781 |
| 44858.375 | 15.738 |
| 44858.385416666664 | 15.721 |
| 44858.395833333336 | 15.702 |
| 44858.40625 | 15.681 |
| 44858.416666666664 | 15.661 |
| 44858.427083333336 | 15.647 |
| 44858.4375 | 15.637 |
| 44858.447916666664 | 15.625 |
| 44858.458333333336 | 15.619 |
| 44858.46875 | 15.618 |
| 44858.479166666664 | 15.625 |
| 44858.489583333336 | 15.641 |
| 44858.5 | 15.671 |
| 44858.510416666664 | 15.689 |
| 44858.520833333336 | 15.698 |
| 44858.53125 | 15.701 |
| 44858.541666666664 | 15.706 |
| 44858.552083333336 | 15.708 |
| 44858.5625 | 15.726 |
| 44858.572916666664 | 15.724 |
| 44858.583333333336 | 15.716 |
| 44858.59375 | 15.703 |
| 44858.604166666664 | 15.723 |
| 44858.614583333336 | 15.744 |
| 44858.625 | 15.789 |
| 44858.635416666664 | 15.769 |
| 44858.645833333336 | 15.848 |
| 44858.65625 | 15.812 |
| 44858.666666666664 | 15.914 |
| 44858.677083333336 | 15.971 |
| 44858.6875 | 16.04 |
| 44858.697916666664 | 16.114 |
| 44858.708333333336 | 16.234 |
| 44858.71875 | 16.226 |
| 44858.729166666664 | 16.32 |
| 44858.739583333336 | 16.412 |
| 44858.75 | 16.457 |
| 44858.760416666664 | 16.368 |
| 44858.770833333336 | 16.279 |
| 44858.78125 | 16.293 |
| 44858.791666666664 | 16.28 |
| 44858.802083333336 | 16.303 |
| 44858.8125 | 16.341 |
| 44858.822916666664 | 16.337 |
| 44858.833333333336 | 16.296 |
| 44858.84375 | 16.302 |
| 44858.854166666664 | 16.302 |
| 44858.864583333336 | 16.324 |
| 44858.875 | 16.339 |
| 44858.885416666664 | 16.36 |
| 44858.895833333336 | 16.348 |
| 44858.90625 | 16.329 |
| 44858.916666666664 | 16.318 |
| 44858.927083333336 | 16.321 |
| 44858.9375 | 16.311 |
| 44858.947916666664 | 16.297 |
| 44858.958333333336 | 16.277 |
| 44858.96875 | 16.265 |
| 44858.979166666664 | 16.261 |
| 44858.989583333336 | 16.257 |
| 44859.0 | 16.249 |
| 44859.010416666664 | 16.246 |
| 44859.020833333336 | 16.244 |
| 44859.03125 | 16.241 |
| 44859.041666666664 | 16.241 |
| 44859.052083333336 | 16.253 |
| 44859.0625 | 16.252 |
| 44859.072916666664 | 16.246 |
| 44859.083333333336 | 16.247 |
| 44859.09375 | 16.247 |
| 44859.104166666664 | 16.24 |
| 44859.114583333336 | 16.24 |
| 44859.125 | 16.239 |
| 44859.135416666664 | 16.238 |
| 44859.145833333336 | 16.237 |
| 44859.15625 | 16.245 |
| 44859.166666666664 | 16.25 |
| 44859.177083333336 | 16.255 |
| 44859.1875 | 16.267 |
| 44859.197916666664 | 16.266 |
| 44859.208333333336 | 16.273 |
| 44859.21875 | 16.279 |
| 44859.229166666664 | 16.286 |
| 44859.239583333336 | 16.289 |
| 44859.25 | 16.289 |
| 44859.260416666664 | 16.288 |
| 44859.270833333336 | 16.289 |
| 44859.28125 | 16.282 |
| 44859.291666666664 | 16.283 |
| 44859.302083333336 | 16.278 |
| 44859.3125 | 16.275 |
| 44859.322916666664 | 16.28 |
| 44859.333333333336 | 16.278 |
| 44859.34375 | 16.267 |
| 44859.354166666664 | 16.252 |
| 44859.364583333336 | 16.221 |
| 44859.375 | 16.194 |
| 44859.385416666664 | 16.179 |
| 44859.395833333336 | 16.17 |
| 44859.40625 | 16.161 |
| 44859.416666666664 | 16.145 |
| 44859.427083333336 | 16.137 |
| 44859.4375 | 16.126 |
| 44859.447916666664 | 16.121 |
| 44859.458333333336 | 16.117 |
| 44859.46875 | 16.105 |
| 44859.479166666664 | 16.094 |
| 44859.489583333336 | 16.086 |
| 44859.5 | 16.078 |
| 44859.510416666664 | 16.075 |
| 44859.520833333336 | 16.073 |
| 44859.53125 | 16.072 |
| 44859.541666666664 | 16.076 |
| 44859.552083333336 | 16.079 |
| 44859.5625 | 16.087 |
| 44859.572916666664 | 16.109 |
| 44859.583333333336 | 16.169 |
| 44859.59375 | 16.169 |
| 44859.604166666664 | 16.206 |
| 44859.614583333336 | 16.233 |
| 44859.625 | 16.261 |
| 44859.635416666664 | 16.263 |
| 44859.645833333336 | 16.307 |
| 44859.65625 | 16.398 |
| 44859.666666666664 | 16.456 |
| 44859.677083333336 | 16.577 |
| 44859.6875 | 16.546 |
| 44859.697916666664 | 16.756 |
| 44859.708333333336 | 16.783 |
| 44859.71875 | 16.853 |
| 44859.729166666664 | 16.854 |
| 44859.739583333336 | 16.966 |
| 44859.75 | 16.936 |
| 44859.760416666664 | 16.941 |
| 44859.770833333336 | 16.921 |
| 44859.78125 | 16.946 |
| 44859.791666666664 | 16.932 |
| 44859.802083333336 | 16.904 |
| 44859.8125 | 16.926 |
| 44859.822916666664 | 16.94 |
| 44859.833333333336 | 16.938 |
| 44859.84375 | 16.933 |
| 44859.854166666664 | 16.912 |
| 44859.864583333336 | 16.897 |
| 44859.875 | 16.898 |
| 44859.885416666664 | 16.883 |
| 44859.895833333336 | 16.86 |
| 44859.90625 | 16.843 |
| 44859.916666666664 | 16.831 |
| 44859.927083333336 | 16.828 |
| 44859.9375 | 16.825 |
| 44859.947916666664 | 16.818 |
| 44859.958333333336 | 16.809 |
| 44859.96875 | 16.797 |
| 44859.979166666664 | 16.782 |
| 44859.989583333336 | 16.764 |
| 44860.0 | 16.749 |
| 44860.010416666664 | 16.73 |
| 44860.020833333336 | 16.706 |
| 44860.03125 | 16.688 |
| 44860.041666666664 | 16.681 |
| 44860.052083333336 | 16.673 |
| 44860.0625 | 16.669 |
| 44860.072916666664 | 16.663 |
| 44860.083333333336 | 16.695 |
| 44860.09375 | 16.707 |
| 44860.104166666664 | 16.69 |
| 44860.114583333336 | 16.713 |
| 44860.125 | 16.692 |
| 44860.135416666664 | 16.725 |
| 44860.145833333336 | 16.728 |
| 44860.15625 | 16.745 |
| 44860.166666666664 | 16.767 |
| 44860.177083333336 | 16.777 |
| 44860.1875 | 16.82 |
| 44860.197916666664 | 16.852 |
| 44860.208333333336 | 16.856 |
| 44860.21875 | 16.863 |
| 44860.229166666664 | 16.868 |
| 44860.239583333336 | 16.887 |
| 44860.25 | 16.905 |
| 44860.260416666664 | 16.908 |
| 44860.270833333336 | 16.927 |
| 44860.28125 | 16.936 |
| 44860.291666666664 | 16.939 |
| 44860.302083333336 | 16.946 |
| 44860.3125 | 16.942 |
| 44860.322916666664 | 16.945 |
| 44860.333333333336 | 16.924 |
| 44860.34375 | 16.929 |
| 44860.354166666664 | 16.927 |
| 44860.364583333336 | 16.912 |
| 44860.375 | 16.885 |
| 44860.385416666664 | 16.84 |
| 44860.395833333336 | 16.806 |
| 44860.40625 | 16.776 |
| 44860.416666666664 | 16.764 |
| 44860.427083333336 | 16.747 |
| 44860.4375 | 16.732 |
| 44860.447916666664 | 16.715 |
| 44860.458333333336 | 16.704 |
| 44860.46875 | 16.69 |
| 44860.479166666664 | 16.672 |
| 44860.489583333336 | 16.655 |
| 44860.5 | 16.642 |
| 44860.510416666664 | 16.637 |
| 44860.520833333336 | 16.64 |
| 44860.53125 | 16.646 |
| 44860.541666666664 | 16.652 |
| 44860.552083333336 | 16.658 |
| 44860.5625 | 16.665 |
| 44860.572916666664 | 16.672 |
| 44860.583333333336 | 16.678 |
| 44860.59375 | 16.688 |
| 44860.604166666664 | 16.699 |
| 44860.614583333336 | 16.722 |
| 44860.625 | 16.772 |
| 44860.635416666664 | 16.813 |
| 44860.645833333336 | 16.92 |
| 44860.65625 | 17.003 |
| 44860.666666666664 | 17.051 |
| 44860.677083333336 | 17.052 |
| 44860.6875 | 17.191 |
| 44860.697916666664 | 17.262 |
| 44860.708333333336 | 17.419 |
| 44860.71875 | 17.491 |
| 44860.729166666664 | 17.559 |
| 44860.739583333336 | 17.641 |
| 44860.75 | 17.734 |
| 44860.760416666664 | 17.904 |
| 44860.770833333336 | 17.938 |
| 44860.78125 | 18.069 |
| 44860.791666666664 | 18.172 |
| 44860.802083333336 | 18.291 |
| 44860.8125 | 18.339 |
| 44860.822916666664 | 18.289 |
| 44860.833333333336 | 18.262 |
| 44860.84375 | 18.247 |
| 44860.854166666664 | 18.288 |
| 44860.864583333336 | 18.269 |
| 44860.875 | 18.257 |
| 44860.885416666664 | 18.22 |
| 44860.895833333336 | 18.183 |
| 44860.90625 | 18.208 |
| 44860.916666666664 | 18.174 |
| 44860.927083333336 | 18.108 |
| 44860.9375 | 18.045 |
| 44860.947916666664 | 18.018 |
| 44860.958333333336 | 17.995 |
| 44860.96875 | 17.971 |
| 44860.979166666664 | 17.953 |
| 44860.989583333336 | 17.936 |
| 44861.0 | 17.916 |
| 44861.010416666664 | 17.888 |
| 44861.020833333336 | 17.871 |
| 44861.03125 | 17.842 |
| 44861.041666666664 | 17.801 |
| 44861.052083333336 | 17.758 |
| 44861.0625 | 17.718 |
| 44861.072916666664 | 17.658 |
| 44861.083333333336 | 17.619 |
| 44861.09375 | 17.588 |
| 44861.104166666664 | 17.594 |
| 44861.114583333336 | 17.611 |
| 44861.125 | 17.615 |
| 44861.135416666664 | 17.56 |
| 44861.145833333336 | 17.541 |
| 44861.15625 | 17.528 |
| 44861.166666666664 | 17.501 |
| 44861.177083333336 | 17.451 |
| 44861.1875 | 17.428 |
| 44861.197916666664 | 17.316 |
| 44861.208333333336 | 17.263 |
| 44861.21875 | 17.204 |
| 44861.229166666664 | 17.204 |
| 44861.239583333336 | 17.152 |
| 44861.25 | 17.203 |
| 44861.260416666664 | 17.178 |
| 44861.270833333336 | 17.255 |
| 44861.28125 | 17.321 |
| 44861.291666666664 | 17.351 |
| 44861.302083333336 | 17.392 |
| 44861.3125 | 17.419 |
| 44861.322916666664 | 17.464 |
| 44861.333333333336 | 17.474 |
| 44861.34375 | 17.422 |
| 44861.354166666664 | 17.442 |
| 44861.364583333336 | 17.371 |
| 44861.375 | 17.349 |
| 44861.385416666664 | 17.37 |
| 44861.395833333336 | 17.353 |
| 44861.40625 | 17.302 |
| 44861.416666666664 | 17.173 |
| 44861.427083333336 | 17.067 |
| 44861.4375 | 16.967 |
| 44861.447916666664 | 16.886 |
| 44861.458333333336 | 16.844 |
| 44861.46875 | 16.789 |
| 44861.479166666664 | 16.722 |
| 44861.489583333336 | 16.676 |
| 44861.5 | 16.663 |
| 44861.510416666664 | 16.658 |
| 44861.520833333336 | 16.673 |
| 44861.53125 | 16.691 |
| 44861.541666666664 | 16.716 |
| 44861.552083333336 | 16.738 |
| 44861.5625 | 16.753 |
| 44861.572916666664 | 16.769 |
| 44861.583333333336 | 16.786 |
| 44861.59375 | 16.815 |
| 44861.604166666664 | 16.857 |
| 44861.614583333336 | 16.939 |
| 44861.625 | 16.971 |
| 44861.635416666664 | 17.018 |
| 44861.645833333336 | 17.137 |
| 44861.65625 | 17.128 |
| 44861.666666666664 | 17.214 |
| 44861.677083333336 | 17.303 |
| 44861.6875 | 17.383 |
| 44861.697916666664 | 17.466 |
| 44861.708333333336 | 17.597 |
| 44861.71875 | 17.594 |
| 44861.729166666664 | 17.696 |
| 44861.739583333336 | 17.877 |
| 44861.75 | 17.937 |
| 44861.760416666664 | 18.08 |
| 44861.770833333336 | 18.353 |
| 44861.78125 | 18.391 |
| 44861.791666666664 | 18.513 |
| 44861.802083333336 | 18.557 |
| 44861.8125 | 18.646 |
| 44861.822916666664 | 18.755 |
| 44861.833333333336 | 18.84 |
| 44861.84375 | 18.895 |
| 44861.854166666664 | 18.943 |
| 44861.864583333336 | 18.921 |
| 44861.875 | 18.772 |
| 44861.885416666664 | 18.683 |
| 44861.895833333336 | 18.628 |
| 44861.90625 | 18.62 |
| 44861.916666666664 | 18.593 |
| 44861.927083333336 | 18.528 |
| 44861.9375 | 18.488 |
| 44861.947916666664 | 18.44 |
| 44861.958333333336 | 18.358 |
| 44861.96875 | 18.296 |
| 44861.979166666664 | 18.213 |
| 44861.989583333336 | 18.138 |
| 44862.0 | 18.112 |
| 44862.010416666664 | 18.06 |
| 44862.020833333336 | 18.002 |
| 44862.03125 | 17.956 |
| 44862.041666666664 | 17.902 |
| 44862.052083333336 | 17.86 |
| 44862.0625 | 17.819 |
| 44862.072916666664 | 17.76 |
| 44862.083333333336 | 17.718 |
| 44862.09375 | 17.693 |
| 44862.104166666664 | 17.657 |
| 44862.114583333336 | 17.631 |
| 44862.125 | 17.604 |
| 44862.135416666664 | 17.627 |
| 44862.145833333336 | 17.62 |
| 44862.15625 | 17.534 |
| 44862.166666666664 | 17.473 |
| 44862.177083333336 | 17.385 |
| 44862.1875 | 17.292 |
| 44862.197916666664 | 17.15 |
| 44862.208333333336 | 17.045 |
| 44862.21875 | 16.902 |
| 44862.229166666664 | 16.71 |
| 44862.239583333336 | 16.681 |
| 44862.25 | 16.511 |
| 44862.260416666664 | 16.57 |
| 44862.270833333336 | 16.472 |
| 44862.28125 | 16.441 |
| 44862.291666666664 | 16.539 |
| 44862.302083333336 | 16.453 |
| 44862.3125 | 16.454 |
| 44862.322916666664 | 16.519 |
| 44862.333333333336 | 16.535 |
| 44862.34375 | 16.567 |
| 44862.354166666664 | 16.536 |
| 44862.364583333336 | 16.531 |
| 44862.375 | 16.524 |
| 44862.385416666664 | 16.474 |
| 44862.395833333336 | 16.468 |
| 44862.40625 | 16.453 |
| 44862.416666666664 | 16.454 |
| 44862.427083333336 | 16.391 |
| 44862.4375 | 16.337 |
| 44862.447916666664 | 16.259 |
| 44862.458333333336 | 16.183 |
| 44862.46875 | 16.105 |
| 44862.479166666664 | 16.067 |
| 44862.489583333336 | 16.015 |
| 44862.5 | 15.974 |
| 44862.510416666664 | 15.954 |
| 44862.520833333336 | 15.933 |
| 44862.53125 | 15.938 |
| 44862.541666666664 | 15.971 |
| 44862.552083333336 | 16.058 |
| 44862.5625 | 16.142 |
| 44862.572916666664 | 16.23 |
| 44862.583333333336 | 16.315 |
| 44862.59375 | 16.361 |
| 44862.604166666664 | 16.379 |
| 44862.614583333336 | 16.411 |
| 44862.625 | 16.414 |
| 44862.635416666664 | 16.419 |
| 44862.645833333336 | 16.464 |
| 44862.65625 | 16.439 |
| 44862.666666666664 | 16.445 |
| 44862.677083333336 | 16.418 |
| 44862.6875 | 16.435 |
| 44862.697916666664 | 16.501 |
| 44862.708333333336 | 16.54 |
| 44862.71875 | 16.584 |
| 44862.729166666664 | 16.629 |
| 44862.739583333336 | 16.626 |
| 44862.75 | 16.685 |
| 44862.760416666664 | 16.687 |
| 44862.770833333336 | 16.715 |
| 44862.78125 | 16.76 |
| 44862.791666666664 | 16.815 |
| 44862.802083333336 | 16.863 |
| 44862.8125 | 16.929 |
| 44862.822916666664 | 16.961 |
| 44862.833333333336 | 17.044 |
| 44862.84375 | 17.065 |
| 44862.854166666664 | 17.063 |
| 44862.864583333336 | 17.023 |
| 44862.875 | 16.944 |
| 44862.885416666664 | 16.888 |
| 44862.895833333336 | 16.834 |
| 44862.90625 | 16.749 |
| 44862.916666666664 | 16.709 |
| 44862.927083333336 | 16.696 |
| 44862.9375 | 16.67 |
| 44862.947916666664 | 16.702 |
| 44862.958333333336 | 16.687 |
| 44862.96875 | 16.697 |
| 44862.979166666664 | 16.678 |
| 44862.989583333336 | 16.664 |
| 44863.0 | 16.645 |
| 44863.010416666664 | 16.595 |
| 44863.020833333336 | 16.545 |
| 44863.03125 | 16.514 |
| 44863.041666666664 | 16.484 |
| 44863.052083333336 | 16.444 |
| 44863.0625 | 16.41 |
| 44863.072916666664 | 16.401 |
| 44863.083333333336 | 16.388 |
| 44863.09375 | 16.375 |
| 44863.104166666664 | 16.362 |
| 44863.114583333336 | 16.351 |
| 44863.125 | 16.342 |
| 44863.135416666664 | 16.337 |
| 44863.145833333336 | 16.331 |
| 44863.15625 | 16.328 |
| 44863.166666666664 | 16.284 |
| 44863.177083333336 | 16.313 |
| 44863.1875 | 16.291 |
| 44863.197916666664 | 16.269 |
| 44863.208333333336 | 16.218 |
| 44863.21875 | 16.161 |
| 44863.229166666664 | 16.11 |
| 44863.239583333336 | 16.067 |
| 44863.25 | 15.951 |
| 44863.260416666664 | 15.917 |
| 44863.270833333336 | 15.812 |
| 44863.28125 | 15.7 |
| 44863.291666666664 | 15.629 |
| 44863.302083333336 | 15.488 |
| 44863.3125 | 15.391 |
| 44863.322916666664 | 15.378 |
| 44863.333333333336 | 15.304 |
| 44863.34375 | 15.281 |
| 44863.354166666664 | 15.185 |
| 44863.364583333336 | 15.17 |
| 44863.375 | 15.132 |
| 44863.385416666664 | 15.168 |
| 44863.395833333336 | 15.199 |
| 44863.40625 | 15.274 |
| 44863.416666666664 | 15.229 |
| 44863.427083333336 | 15.258 |
| 44863.4375 | 15.242 |
| 44863.447916666664 | 15.245 |
| 44863.458333333336 | 15.225 |
| 44863.46875 | 15.225 |
| 44863.479166666664 | 15.211 |
| 44863.489583333336 | 15.192 |
| 44863.5 | 15.196 |
| 44863.510416666664 | 15.219 |
| 44863.520833333336 | 15.187 |
| 44863.53125 | 15.159 |
| 44863.541666666664 | 15.132 |
| 44863.552083333336 | 15.132 |
| 44863.5625 | 15.145 |
| 44863.572916666664 | 15.165 |
| 44863.583333333336 | 15.195 |
| 44863.59375 | 15.248 |
| 44863.604166666664 | 15.328 |
| 44863.614583333336 | 15.416 |
| 44863.625 | 15.508 |
| 44863.635416666664 | 15.602 |
| 44863.645833333336 | 15.687 |
| 44863.65625 | 15.747 |
| 44863.666666666664 | 15.827 |
| 44863.677083333336 | 15.861 |
| 44863.6875 | 15.902 |
| 44863.697916666664 | 15.798 |
| 44863.708333333336 | 15.924 |
| 44863.71875 | 15.986 |
| 44863.729166666664 | 16.035 |
| 44863.739583333336 | 16.107 |
| 44863.75 | 16.179 |
| 44863.760416666664 | 16.244 |
| 44863.770833333336 | 16.323 |
| 44863.78125 | 16.356 |
| 44863.791666666664 | 16.403 |
| 44863.802083333336 | 16.508 |
| 44863.8125 | 16.609 |
| 44863.822916666664 | 16.671 |
| 44863.833333333336 | 16.724 |
| 44863.84375 | 16.715 |
| 44863.854166666664 | 16.803 |
| 44863.864583333336 | 16.805 |
| 44863.875 | 16.765 |
| 44863.885416666664 | 16.669 |
| 44863.895833333336 | 16.66 |
| 44863.90625 | 16.545 |
| 44863.916666666664 | 16.404 |
| 44863.927083333336 | 16.25 |
| 44863.9375 | 16.147 |
| 44863.947916666664 | 16.08 |
| 44863.958333333336 | 16.086 |
| 44863.96875 | 16.111 |
| 44863.979166666664 | 16.097 |
| 44863.989583333336 | 16.116 |
| 44864.0 | 16.1 |
| 44864.010416666664 | 16.079 |
| 44864.020833333336 | 16.075 |
| 44864.03125 | 16.064 |
| 44864.041666666664 | 16.058 |
| 44864.052083333336 | 16.03 |
| 44864.0625 | 15.976 |
| 44864.072916666664 | 15.938 |
| 44864.083333333336 | 15.933 |
| 44864.09375 | 15.92 |
| 44864.104166666664 | 15.911 |
| 44864.114583333336 | 15.902 |
| 44864.125 | 15.886 |
| 44864.135416666664 | 15.858 |
| 44864.145833333336 | 15.831 |
| 44864.15625 | 15.81 |
| 44864.166666666664 | 15.789 |
| 44864.177083333336 | 15.78 |
| 44864.1875 | 15.769 |
| 44864.197916666664 | 15.761 |
| 44864.208333333336 | 15.802 |
| 44864.21875 | 15.766 |
| 44864.229166666664 | 15.736 |
| 44864.239583333336 | 15.687 |
| 44864.25 | 15.619 |
| 44864.260416666664 | 15.515 |
| 44864.270833333336 | 15.542 |
| 44864.28125 | 15.373 |
| 44864.291666666664 | 15.36 |
| 44864.302083333336 | 15.258 |
| 44864.3125 | 15.195 |
| 44864.322916666664 | 15.046 |
| 44864.333333333336 | 15.066 |
| 44864.34375 | 14.952 |
| 44864.354166666664 | 14.949 |
| 44864.364583333336 | 15.063 |
| 44864.375 | 14.905 |
| 44864.385416666664 | 14.876 |
| 44864.395833333336 | 14.944 |
| 44864.40625 | 14.855 |
| 44864.416666666664 | 14.885 |
| 44864.427083333336 | 14.94 |
| 44864.4375 | 14.89 |
| 44864.447916666664 | 14.94 |
| 44864.458333333336 | 14.943 |
| 44864.46875 | 14.914 |
| 44864.479166666664 | 14.917 |
| 44864.489583333336 | 14.926 |
| 44864.5 | 14.915 |
| 44864.510416666664 | 14.919 |
| 44864.520833333336 | 14.934 |
| 44864.53125 | 14.945 |
| 44864.541666666664 | 15.003 |
| 44864.552083333336 | 15.107 |
| 44864.5625 | 15.11 |
| 44864.572916666664 | 15.11 |
| 44864.583333333336 | 15.123 |
| 44864.59375 | 15.163 |
| 44864.604166666664 | 15.204 |
| 44864.614583333336 | 15.245 |
| 44864.625 | 15.304 |
| 44864.635416666664 | 15.387 |
| 44864.645833333336 | 15.461 |
| 44864.65625 | 15.604 |
| 44864.666666666664 | 15.733 |
| 44864.677083333336 | 15.811 |
| 44864.6875 | 15.9 |
| 44864.697916666664 | 15.961 |
| 44864.708333333336 | 16.037 |
| 44864.71875 | 16.067 |
| 44864.729166666664 | 16.03 |
| 44864.739583333336 | 16.22 |
| 44864.75 | 16.272 |
| 44864.760416666664 | 16.31 |
| 44864.770833333336 | 16.362 |
| 44864.78125 | 16.414 |
| 44864.791666666664 | 16.447 |
| 44864.802083333336 | 16.413 |
| 44864.8125 | 16.477 |
| 44864.822916666664 | 16.569 |
| 44864.833333333336 | 16.616 |
| 44864.84375 | 16.741 |
| 44864.854166666664 | 16.808 |
| 44864.864583333336 | 16.786 |
| 44864.875 | 16.77 |
| 44864.885416666664 | 16.852 |
| 44864.895833333336 | 16.797 |
| 44864.90625 | 16.806 |
| 44864.916666666664 | 16.765 |
| 44864.927083333336 | 16.714 |
| 44864.9375 | 16.735 |
| 44864.947916666664 | 16.612 |
| 44864.958333333336 | 16.564 |
| 44864.96875 | 16.445 |
| 44864.979166666664 | 16.396 |
| 44864.989583333336 | 16.363 |
| 44865.0 | 16.347 |
| 44865.010416666664 | 16.34 |
| 44865.020833333336 | 16.339 |
| 44865.03125 | 16.357 |
| 44865.041666666664 | 16.349 |
| 44865.052083333336 | 16.333 |
| 44865.0625 | 16.341 |
| 44865.072916666664 | 16.345 |
| 44865.083333333336 | 16.34 |
| 44865.09375 | 16.332 |
| 44865.104166666664 | 16.299 |
| 44865.114583333336 | 16.26 |
| 44865.125 | 16.257 |
| 44865.135416666664 | 16.238 |
| 44865.145833333336 | 16.238 |
| 44865.15625 | 16.229 |
| 44865.166666666664 | 16.201 |
| 44865.177083333336 | 16.171 |
| 44865.1875 | 16.149 |
| 44865.197916666664 | 16.132 |
| 44865.208333333336 | 16.115 |
| 44865.21875 | 16.108 |
| 44865.229166666664 | 16.098 |
| 44865.239583333336 | 16.054 |
| 44865.25 | 16.049 |
| 44865.260416666664 | 15.958 |
| 44865.270833333336 | 15.912 |
| 44865.28125 | 15.839 |
| 44865.291666666664 | 15.777 |
| 44865.302083333336 | 15.56 |
| 44865.3125 | 15.534 |
| 44865.322916666664 | 15.55 |
| 44865.333333333336 | 15.363 |
| 44865.34375 | 15.583 |
| 44865.354166666664 | 15.327 |
| 44865.364583333336 | 15.225 |
| 44865.375 | 15.148 |
| 44865.385416666664 | 15.147 |
| 44865.395833333336 | 15.031 |
| 44865.40625 | 14.954 |
| 44865.416666666664 | 14.971 |
| 44865.427083333336 | 14.927 |
| 44865.4375 | 14.884 |
| 44865.447916666664 | 14.914 |
| 44865.458333333336 | 14.912 |
| 44865.46875 | 14.887 |
| 44865.479166666664 | 14.907 |
| 44865.489583333336 | 14.887 |
| 44865.5 | 14.912 |
| 44865.510416666664 | 14.891 |
| 44865.520833333336 | 14.925 |
| 44865.53125 | 14.922 |
| 44865.541666666664 | 14.957 |
| 44865.552083333336 | 14.999 |
| 44865.5625 | 15.048 |
| 44865.572916666664 | 15.15 |
| 44865.583333333336 | 15.255 |
| 44865.59375 | 15.336 |
| 44865.604166666664 | 15.406 |
| 44865.614583333336 | 15.485 |
| 44865.625 | 15.569 |
| 44865.635416666664 | 15.693 |
| 44865.645833333336 | 15.817 |
| 44865.65625 | 15.901 |
| 44865.666666666664 | 15.998 |
| 44865.677083333336 | 16.06 |
| 44865.6875 | 16.229 |
| 44865.697916666664 | 16.291 |
| 44865.708333333336 | 16.408 |
| 44865.71875 | 16.483 |
| 44865.729166666664 | 16.542 |
| 44865.739583333336 | 16.6 |
| 44865.75 | 16.625 |
| 44865.760416666664 | 16.651 |
| 44865.770833333336 | 16.69 |
| 44865.78125 | 16.603 |
| 44865.791666666664 | 16.647 |
| 44865.802083333336 | 17.035 |
| 44865.8125 | 17.044 |
| 44865.822916666664 | 17.039 |
| 44865.833333333336 | 17.306 |
| 44865.84375 | 17.129 |
| 44865.854166666664 | 17.244 |
| 44865.864583333336 | 17.257 |
| 44865.875 | 17.382 |
| 44865.885416666664 | 17.426 |
| 44865.895833333336 | 17.403 |
| 44865.90625 | 17.508 |
| 44865.916666666664 | 17.385 |
| 44865.927083333336 | 17.432 |
| 44865.9375 | 17.404 |
| 44865.947916666664 | 17.431 |
| 44865.958333333336 | 17.402 |
| 44865.96875 | 17.43 |
| 44865.979166666664 | 17.439 |
| 44865.989583333336 | 17.309 |
| 44866.0 | 17.239 |
| 44866.010416666664 | 17.189 |
| 44866.020833333336 | 17.115 |
| 44866.03125 | 17.057 |
| 44866.041666666664 | 17.02 |
| 44866.052083333336 | 17.021 |
| 44866.0625 | 17.07 |
| 44866.072916666664 | 17.07 |
| 44866.083333333336 | 17.048 |
| 44866.09375 | 17.062 |
| 44866.104166666664 | 17.081 |
| 44866.114583333336 | 17.097 |
| 44866.125 | 17.083 |
| 44866.135416666664 | 17.023 |
| 44866.145833333336 | 17.018 |